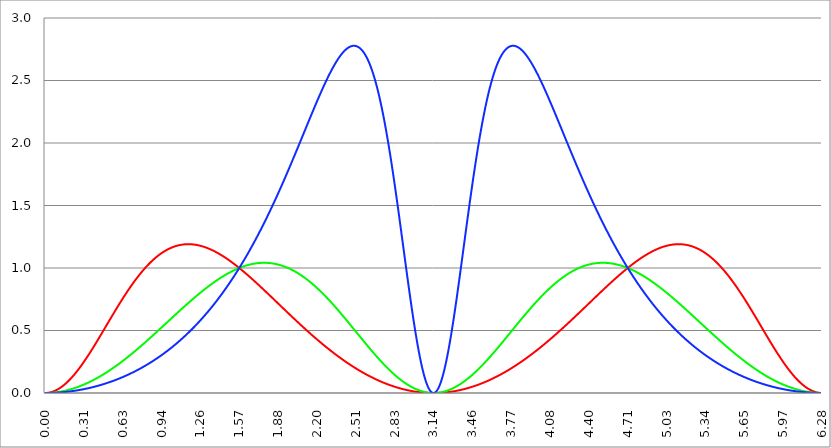
| Category | Series 1 | Series 0 | Series 2 |
|---|---|---|---|
| 0.0 | 0 | 0 | 0 |
| 0.00314159265358979 | 0 | 0 | 0 |
| 0.00628318530717958 | 0 | 0 | 0 |
| 0.00942477796076938 | 0 | 0 | 0 |
| 0.0125663706143592 | 0 | 0 | 0 |
| 0.015707963267949 | 0.001 | 0 | 0 |
| 0.0188495559215388 | 0.001 | 0 | 0 |
| 0.0219911485751285 | 0.001 | 0 | 0 |
| 0.0251327412287183 | 0.002 | 0 | 0 |
| 0.0282743338823081 | 0.002 | 0.001 | 0 |
| 0.0314159265358979 | 0.003 | 0.001 | 0 |
| 0.0345575191894877 | 0.003 | 0.001 | 0 |
| 0.0376991118430775 | 0.004 | 0.001 | 0 |
| 0.0408407044966673 | 0.005 | 0.001 | 0.001 |
| 0.0439822971502571 | 0.005 | 0.001 | 0.001 |
| 0.0471238898038469 | 0.006 | 0.002 | 0.001 |
| 0.0502654824574367 | 0.007 | 0.002 | 0.001 |
| 0.0534070751110265 | 0.008 | 0.002 | 0.001 |
| 0.0565486677646163 | 0.009 | 0.002 | 0.001 |
| 0.059690260418206 | 0.01 | 0.002 | 0.001 |
| 0.0628318530717958 | 0.011 | 0.003 | 0.001 |
| 0.0659734457253856 | 0.012 | 0.003 | 0.001 |
| 0.0691150383789754 | 0.013 | 0.003 | 0.001 |
| 0.0722566310325652 | 0.014 | 0.004 | 0.002 |
| 0.075398223686155 | 0.016 | 0.004 | 0.002 |
| 0.0785398163397448 | 0.017 | 0.004 | 0.002 |
| 0.0816814089933346 | 0.018 | 0.005 | 0.002 |
| 0.0848230016469244 | 0.02 | 0.005 | 0.002 |
| 0.0879645943005142 | 0.021 | 0.005 | 0.002 |
| 0.091106186954104 | 0.023 | 0.006 | 0.003 |
| 0.0942477796076937 | 0.024 | 0.006 | 0.003 |
| 0.0973893722612835 | 0.026 | 0.007 | 0.003 |
| 0.100530964914873 | 0.028 | 0.007 | 0.003 |
| 0.103672557568463 | 0.03 | 0.007 | 0.003 |
| 0.106814150222053 | 0.031 | 0.008 | 0.004 |
| 0.109955742875643 | 0.033 | 0.008 | 0.004 |
| 0.113097335529233 | 0.035 | 0.009 | 0.004 |
| 0.116238928182822 | 0.037 | 0.009 | 0.004 |
| 0.119380520836412 | 0.039 | 0.01 | 0.004 |
| 0.122522113490002 | 0.041 | 0.01 | 0.005 |
| 0.125663706143592 | 0.043 | 0.011 | 0.005 |
| 0.128805298797181 | 0.045 | 0.011 | 0.005 |
| 0.131946891450771 | 0.048 | 0.012 | 0.005 |
| 0.135088484104361 | 0.05 | 0.013 | 0.006 |
| 0.138230076757951 | 0.052 | 0.013 | 0.006 |
| 0.141371669411541 | 0.054 | 0.014 | 0.006 |
| 0.14451326206513 | 0.057 | 0.014 | 0.006 |
| 0.14765485471872 | 0.059 | 0.015 | 0.007 |
| 0.15079644737231 | 0.062 | 0.016 | 0.007 |
| 0.1539380400259 | 0.064 | 0.016 | 0.007 |
| 0.15707963267949 | 0.067 | 0.017 | 0.008 |
| 0.160221225333079 | 0.07 | 0.018 | 0.008 |
| 0.163362817986669 | 0.072 | 0.018 | 0.008 |
| 0.166504410640259 | 0.075 | 0.019 | 0.009 |
| 0.169646003293849 | 0.078 | 0.02 | 0.009 |
| 0.172787595947439 | 0.081 | 0.021 | 0.009 |
| 0.175929188601028 | 0.083 | 0.021 | 0.01 |
| 0.179070781254618 | 0.086 | 0.022 | 0.01 |
| 0.182212373908208 | 0.089 | 0.023 | 0.01 |
| 0.185353966561798 | 0.092 | 0.024 | 0.011 |
| 0.188495559215388 | 0.095 | 0.025 | 0.011 |
| 0.191637151868977 | 0.098 | 0.025 | 0.011 |
| 0.194778744522567 | 0.101 | 0.026 | 0.012 |
| 0.197920337176157 | 0.105 | 0.027 | 0.012 |
| 0.201061929829747 | 0.108 | 0.028 | 0.013 |
| 0.204203522483336 | 0.111 | 0.029 | 0.013 |
| 0.207345115136926 | 0.114 | 0.03 | 0.013 |
| 0.210486707790516 | 0.118 | 0.031 | 0.014 |
| 0.213628300444106 | 0.121 | 0.031 | 0.014 |
| 0.216769893097696 | 0.125 | 0.032 | 0.015 |
| 0.219911485751285 | 0.128 | 0.033 | 0.015 |
| 0.223053078404875 | 0.132 | 0.034 | 0.015 |
| 0.226194671058465 | 0.135 | 0.035 | 0.016 |
| 0.229336263712055 | 0.139 | 0.036 | 0.016 |
| 0.232477856365645 | 0.142 | 0.037 | 0.017 |
| 0.235619449019234 | 0.146 | 0.038 | 0.017 |
| 0.238761041672824 | 0.15 | 0.039 | 0.018 |
| 0.241902634326414 | 0.153 | 0.04 | 0.018 |
| 0.245044226980004 | 0.157 | 0.041 | 0.019 |
| 0.248185819633594 | 0.161 | 0.042 | 0.019 |
| 0.251327412287183 | 0.165 | 0.043 | 0.02 |
| 0.254469004940773 | 0.169 | 0.044 | 0.02 |
| 0.257610597594363 | 0.173 | 0.046 | 0.021 |
| 0.260752190247953 | 0.177 | 0.047 | 0.021 |
| 0.263893782901543 | 0.181 | 0.048 | 0.022 |
| 0.267035375555132 | 0.185 | 0.049 | 0.022 |
| 0.270176968208722 | 0.189 | 0.05 | 0.023 |
| 0.273318560862312 | 0.193 | 0.051 | 0.023 |
| 0.276460153515902 | 0.197 | 0.052 | 0.024 |
| 0.279601746169492 | 0.201 | 0.054 | 0.024 |
| 0.282743338823082 | 0.205 | 0.055 | 0.025 |
| 0.285884931476671 | 0.209 | 0.056 | 0.025 |
| 0.289026524130261 | 0.214 | 0.057 | 0.026 |
| 0.292168116783851 | 0.218 | 0.058 | 0.027 |
| 0.295309709437441 | 0.222 | 0.06 | 0.027 |
| 0.298451302091031 | 0.227 | 0.061 | 0.028 |
| 0.30159289474462 | 0.231 | 0.062 | 0.028 |
| 0.30473448739821 | 0.235 | 0.063 | 0.029 |
| 0.3078760800518 | 0.24 | 0.065 | 0.03 |
| 0.31101767270539 | 0.244 | 0.066 | 0.03 |
| 0.31415926535898 | 0.249 | 0.067 | 0.031 |
| 0.31730085801257 | 0.253 | 0.069 | 0.031 |
| 0.320442450666159 | 0.258 | 0.07 | 0.032 |
| 0.323584043319749 | 0.262 | 0.071 | 0.033 |
| 0.326725635973339 | 0.267 | 0.073 | 0.033 |
| 0.329867228626929 | 0.272 | 0.074 | 0.034 |
| 0.333008821280519 | 0.276 | 0.076 | 0.035 |
| 0.336150413934108 | 0.281 | 0.077 | 0.035 |
| 0.339292006587698 | 0.286 | 0.078 | 0.036 |
| 0.342433599241288 | 0.29 | 0.08 | 0.037 |
| 0.345575191894878 | 0.295 | 0.081 | 0.037 |
| 0.348716784548468 | 0.3 | 0.083 | 0.038 |
| 0.351858377202058 | 0.305 | 0.084 | 0.039 |
| 0.354999969855647 | 0.309 | 0.086 | 0.039 |
| 0.358141562509237 | 0.314 | 0.087 | 0.04 |
| 0.361283155162827 | 0.319 | 0.089 | 0.041 |
| 0.364424747816417 | 0.324 | 0.09 | 0.042 |
| 0.367566340470007 | 0.329 | 0.092 | 0.042 |
| 0.370707933123597 | 0.334 | 0.093 | 0.043 |
| 0.373849525777186 | 0.339 | 0.095 | 0.044 |
| 0.376991118430776 | 0.344 | 0.096 | 0.045 |
| 0.380132711084366 | 0.348 | 0.098 | 0.045 |
| 0.383274303737956 | 0.353 | 0.1 | 0.046 |
| 0.386415896391546 | 0.358 | 0.101 | 0.047 |
| 0.389557489045135 | 0.363 | 0.103 | 0.048 |
| 0.392699081698725 | 0.368 | 0.104 | 0.048 |
| 0.395840674352315 | 0.373 | 0.106 | 0.049 |
| 0.398982267005905 | 0.379 | 0.108 | 0.05 |
| 0.402123859659495 | 0.384 | 0.109 | 0.051 |
| 0.405265452313085 | 0.389 | 0.111 | 0.052 |
| 0.408407044966674 | 0.394 | 0.113 | 0.052 |
| 0.411548637620264 | 0.399 | 0.114 | 0.053 |
| 0.414690230273854 | 0.404 | 0.116 | 0.054 |
| 0.417831822927444 | 0.409 | 0.118 | 0.055 |
| 0.420973415581034 | 0.414 | 0.119 | 0.056 |
| 0.424115008234623 | 0.419 | 0.121 | 0.057 |
| 0.427256600888213 | 0.425 | 0.123 | 0.057 |
| 0.430398193541803 | 0.43 | 0.125 | 0.058 |
| 0.433539786195393 | 0.435 | 0.126 | 0.059 |
| 0.436681378848983 | 0.44 | 0.128 | 0.06 |
| 0.439822971502573 | 0.445 | 0.13 | 0.061 |
| 0.442964564156162 | 0.45 | 0.132 | 0.062 |
| 0.446106156809752 | 0.456 | 0.134 | 0.063 |
| 0.449247749463342 | 0.461 | 0.135 | 0.064 |
| 0.452389342116932 | 0.466 | 0.137 | 0.065 |
| 0.455530934770522 | 0.471 | 0.139 | 0.066 |
| 0.458672527424111 | 0.477 | 0.141 | 0.066 |
| 0.461814120077701 | 0.482 | 0.143 | 0.067 |
| 0.464955712731291 | 0.487 | 0.145 | 0.068 |
| 0.468097305384881 | 0.492 | 0.147 | 0.069 |
| 0.471238898038471 | 0.498 | 0.148 | 0.07 |
| 0.474380490692061 | 0.503 | 0.15 | 0.071 |
| 0.47752208334565 | 0.508 | 0.152 | 0.072 |
| 0.48066367599924 | 0.513 | 0.154 | 0.073 |
| 0.48380526865283 | 0.519 | 0.156 | 0.074 |
| 0.48694686130642 | 0.524 | 0.158 | 0.075 |
| 0.49008845396001 | 0.529 | 0.16 | 0.076 |
| 0.493230046613599 | 0.534 | 0.162 | 0.077 |
| 0.496371639267189 | 0.54 | 0.164 | 0.078 |
| 0.499513231920779 | 0.545 | 0.166 | 0.079 |
| 0.502654824574369 | 0.55 | 0.168 | 0.08 |
| 0.505796417227959 | 0.555 | 0.17 | 0.081 |
| 0.508938009881549 | 0.561 | 0.172 | 0.082 |
| 0.512079602535138 | 0.566 | 0.174 | 0.083 |
| 0.515221195188728 | 0.571 | 0.176 | 0.084 |
| 0.518362787842318 | 0.576 | 0.178 | 0.085 |
| 0.521504380495908 | 0.582 | 0.18 | 0.087 |
| 0.524645973149498 | 0.587 | 0.182 | 0.088 |
| 0.527787565803087 | 0.592 | 0.184 | 0.089 |
| 0.530929158456677 | 0.597 | 0.186 | 0.09 |
| 0.534070751110267 | 0.603 | 0.189 | 0.091 |
| 0.537212343763857 | 0.608 | 0.191 | 0.092 |
| 0.540353936417447 | 0.613 | 0.193 | 0.093 |
| 0.543495529071037 | 0.618 | 0.195 | 0.094 |
| 0.546637121724626 | 0.624 | 0.197 | 0.095 |
| 0.549778714378216 | 0.629 | 0.199 | 0.096 |
| 0.552920307031806 | 0.634 | 0.201 | 0.098 |
| 0.556061899685396 | 0.639 | 0.204 | 0.099 |
| 0.559203492338986 | 0.644 | 0.206 | 0.1 |
| 0.562345084992576 | 0.649 | 0.208 | 0.101 |
| 0.565486677646165 | 0.655 | 0.21 | 0.102 |
| 0.568628270299755 | 0.66 | 0.212 | 0.103 |
| 0.571769862953345 | 0.665 | 0.215 | 0.105 |
| 0.574911455606935 | 0.67 | 0.217 | 0.106 |
| 0.578053048260525 | 0.675 | 0.219 | 0.107 |
| 0.581194640914114 | 0.68 | 0.221 | 0.108 |
| 0.584336233567704 | 0.685 | 0.224 | 0.109 |
| 0.587477826221294 | 0.69 | 0.226 | 0.111 |
| 0.590619418874884 | 0.695 | 0.228 | 0.112 |
| 0.593761011528474 | 0.701 | 0.23 | 0.113 |
| 0.596902604182064 | 0.706 | 0.233 | 0.114 |
| 0.600044196835653 | 0.711 | 0.235 | 0.116 |
| 0.603185789489243 | 0.716 | 0.237 | 0.117 |
| 0.606327382142833 | 0.721 | 0.24 | 0.118 |
| 0.609468974796423 | 0.726 | 0.242 | 0.119 |
| 0.612610567450013 | 0.731 | 0.244 | 0.121 |
| 0.615752160103602 | 0.736 | 0.247 | 0.122 |
| 0.618893752757192 | 0.74 | 0.249 | 0.123 |
| 0.622035345410782 | 0.745 | 0.251 | 0.125 |
| 0.625176938064372 | 0.75 | 0.254 | 0.126 |
| 0.628318530717962 | 0.755 | 0.256 | 0.127 |
| 0.631460123371551 | 0.76 | 0.258 | 0.129 |
| 0.634601716025141 | 0.765 | 0.261 | 0.13 |
| 0.637743308678731 | 0.77 | 0.263 | 0.131 |
| 0.640884901332321 | 0.775 | 0.266 | 0.133 |
| 0.644026493985911 | 0.779 | 0.268 | 0.134 |
| 0.647168086639501 | 0.784 | 0.27 | 0.135 |
| 0.65030967929309 | 0.789 | 0.273 | 0.137 |
| 0.65345127194668 | 0.794 | 0.275 | 0.138 |
| 0.65659286460027 | 0.798 | 0.278 | 0.14 |
| 0.65973445725386 | 0.803 | 0.28 | 0.141 |
| 0.66287604990745 | 0.808 | 0.283 | 0.142 |
| 0.666017642561039 | 0.812 | 0.285 | 0.144 |
| 0.669159235214629 | 0.817 | 0.288 | 0.145 |
| 0.672300827868219 | 0.822 | 0.29 | 0.147 |
| 0.675442420521809 | 0.826 | 0.292 | 0.148 |
| 0.678584013175399 | 0.831 | 0.295 | 0.15 |
| 0.681725605828989 | 0.835 | 0.297 | 0.151 |
| 0.684867198482578 | 0.84 | 0.3 | 0.153 |
| 0.688008791136168 | 0.844 | 0.303 | 0.154 |
| 0.691150383789758 | 0.849 | 0.305 | 0.156 |
| 0.694291976443348 | 0.853 | 0.308 | 0.157 |
| 0.697433569096938 | 0.858 | 0.31 | 0.159 |
| 0.700575161750528 | 0.862 | 0.313 | 0.16 |
| 0.703716754404117 | 0.867 | 0.315 | 0.162 |
| 0.706858347057707 | 0.871 | 0.318 | 0.163 |
| 0.709999939711297 | 0.875 | 0.32 | 0.165 |
| 0.713141532364887 | 0.88 | 0.323 | 0.166 |
| 0.716283125018477 | 0.884 | 0.325 | 0.168 |
| 0.719424717672066 | 0.888 | 0.328 | 0.169 |
| 0.722566310325656 | 0.893 | 0.331 | 0.171 |
| 0.725707902979246 | 0.897 | 0.333 | 0.172 |
| 0.728849495632836 | 0.901 | 0.336 | 0.174 |
| 0.731991088286426 | 0.905 | 0.338 | 0.176 |
| 0.735132680940016 | 0.909 | 0.341 | 0.177 |
| 0.738274273593605 | 0.914 | 0.344 | 0.179 |
| 0.741415866247195 | 0.918 | 0.346 | 0.18 |
| 0.744557458900785 | 0.922 | 0.349 | 0.182 |
| 0.747699051554375 | 0.926 | 0.352 | 0.184 |
| 0.750840644207965 | 0.93 | 0.354 | 0.185 |
| 0.753982236861554 | 0.934 | 0.357 | 0.187 |
| 0.757123829515144 | 0.938 | 0.36 | 0.189 |
| 0.760265422168734 | 0.942 | 0.362 | 0.19 |
| 0.763407014822324 | 0.946 | 0.365 | 0.192 |
| 0.766548607475914 | 0.949 | 0.368 | 0.194 |
| 0.769690200129504 | 0.953 | 0.37 | 0.195 |
| 0.772831792783093 | 0.957 | 0.373 | 0.197 |
| 0.775973385436683 | 0.961 | 0.376 | 0.199 |
| 0.779114978090273 | 0.965 | 0.378 | 0.2 |
| 0.782256570743863 | 0.968 | 0.381 | 0.202 |
| 0.785398163397453 | 0.972 | 0.384 | 0.204 |
| 0.788539756051042 | 0.976 | 0.386 | 0.206 |
| 0.791681348704632 | 0.98 | 0.389 | 0.207 |
| 0.794822941358222 | 0.983 | 0.392 | 0.209 |
| 0.797964534011812 | 0.987 | 0.395 | 0.211 |
| 0.801106126665402 | 0.99 | 0.397 | 0.213 |
| 0.804247719318992 | 0.994 | 0.4 | 0.215 |
| 0.807389311972581 | 0.997 | 0.403 | 0.216 |
| 0.810530904626171 | 1.001 | 0.406 | 0.218 |
| 0.813672497279761 | 1.004 | 0.408 | 0.22 |
| 0.816814089933351 | 1.008 | 0.411 | 0.222 |
| 0.819955682586941 | 1.011 | 0.414 | 0.224 |
| 0.823097275240531 | 1.014 | 0.417 | 0.226 |
| 0.82623886789412 | 1.018 | 0.419 | 0.227 |
| 0.82938046054771 | 1.021 | 0.422 | 0.229 |
| 0.8325220532013 | 1.024 | 0.425 | 0.231 |
| 0.83566364585489 | 1.028 | 0.428 | 0.233 |
| 0.83880523850848 | 1.031 | 0.431 | 0.235 |
| 0.841946831162069 | 1.034 | 0.433 | 0.237 |
| 0.845088423815659 | 1.037 | 0.436 | 0.239 |
| 0.848230016469249 | 1.04 | 0.439 | 0.241 |
| 0.851371609122839 | 1.043 | 0.442 | 0.243 |
| 0.854513201776429 | 1.046 | 0.444 | 0.245 |
| 0.857654794430019 | 1.049 | 0.447 | 0.246 |
| 0.860796387083608 | 1.052 | 0.45 | 0.248 |
| 0.863937979737198 | 1.055 | 0.453 | 0.25 |
| 0.867079572390788 | 1.058 | 0.456 | 0.252 |
| 0.870221165044378 | 1.061 | 0.459 | 0.254 |
| 0.873362757697968 | 1.064 | 0.461 | 0.256 |
| 0.876504350351557 | 1.067 | 0.464 | 0.258 |
| 0.879645943005147 | 1.07 | 0.467 | 0.26 |
| 0.882787535658737 | 1.072 | 0.47 | 0.262 |
| 0.885929128312327 | 1.075 | 0.473 | 0.264 |
| 0.889070720965917 | 1.078 | 0.476 | 0.267 |
| 0.892212313619507 | 1.08 | 0.478 | 0.269 |
| 0.895353906273096 | 1.083 | 0.481 | 0.271 |
| 0.898495498926686 | 1.086 | 0.484 | 0.273 |
| 0.901637091580276 | 1.088 | 0.487 | 0.275 |
| 0.904778684233866 | 1.091 | 0.49 | 0.277 |
| 0.907920276887456 | 1.093 | 0.493 | 0.279 |
| 0.911061869541045 | 1.096 | 0.495 | 0.281 |
| 0.914203462194635 | 1.098 | 0.498 | 0.283 |
| 0.917345054848225 | 1.101 | 0.501 | 0.285 |
| 0.920486647501815 | 1.103 | 0.504 | 0.288 |
| 0.923628240155405 | 1.105 | 0.507 | 0.29 |
| 0.926769832808995 | 1.108 | 0.51 | 0.292 |
| 0.929911425462584 | 1.11 | 0.513 | 0.294 |
| 0.933053018116174 | 1.112 | 0.515 | 0.296 |
| 0.936194610769764 | 1.114 | 0.518 | 0.298 |
| 0.939336203423354 | 1.117 | 0.521 | 0.301 |
| 0.942477796076944 | 1.119 | 0.524 | 0.303 |
| 0.945619388730533 | 1.121 | 0.527 | 0.305 |
| 0.948760981384123 | 1.123 | 0.53 | 0.307 |
| 0.951902574037713 | 1.125 | 0.533 | 0.309 |
| 0.955044166691303 | 1.127 | 0.536 | 0.312 |
| 0.958185759344893 | 1.129 | 0.538 | 0.314 |
| 0.961327351998483 | 1.131 | 0.541 | 0.316 |
| 0.964468944652072 | 1.133 | 0.544 | 0.319 |
| 0.967610537305662 | 1.135 | 0.547 | 0.321 |
| 0.970752129959252 | 1.137 | 0.55 | 0.323 |
| 0.973893722612842 | 1.138 | 0.553 | 0.326 |
| 0.977035315266432 | 1.14 | 0.556 | 0.328 |
| 0.980176907920022 | 1.142 | 0.559 | 0.33 |
| 0.983318500573611 | 1.144 | 0.561 | 0.333 |
| 0.986460093227201 | 1.145 | 0.564 | 0.335 |
| 0.989601685880791 | 1.147 | 0.567 | 0.337 |
| 0.992743278534381 | 1.149 | 0.57 | 0.34 |
| 0.995884871187971 | 1.15 | 0.573 | 0.342 |
| 0.99902646384156 | 1.152 | 0.576 | 0.344 |
| 1.00216805649515 | 1.153 | 0.579 | 0.347 |
| 1.00530964914874 | 1.155 | 0.582 | 0.349 |
| 1.00845124180233 | 1.156 | 0.584 | 0.352 |
| 1.01159283445592 | 1.158 | 0.587 | 0.354 |
| 1.01473442710951 | 1.159 | 0.59 | 0.357 |
| 1.017876019763099 | 1.161 | 0.593 | 0.359 |
| 1.021017612416689 | 1.162 | 0.596 | 0.362 |
| 1.02415920507028 | 1.163 | 0.599 | 0.364 |
| 1.027300797723869 | 1.165 | 0.602 | 0.367 |
| 1.030442390377459 | 1.166 | 0.605 | 0.369 |
| 1.033583983031048 | 1.167 | 0.607 | 0.372 |
| 1.036725575684638 | 1.168 | 0.61 | 0.374 |
| 1.039867168338228 | 1.169 | 0.613 | 0.377 |
| 1.043008760991818 | 1.17 | 0.616 | 0.379 |
| 1.046150353645408 | 1.172 | 0.619 | 0.382 |
| 1.049291946298998 | 1.173 | 0.622 | 0.384 |
| 1.052433538952587 | 1.174 | 0.625 | 0.387 |
| 1.055575131606177 | 1.175 | 0.627 | 0.39 |
| 1.058716724259767 | 1.176 | 0.63 | 0.392 |
| 1.061858316913357 | 1.176 | 0.633 | 0.395 |
| 1.064999909566947 | 1.177 | 0.636 | 0.397 |
| 1.068141502220536 | 1.178 | 0.639 | 0.4 |
| 1.071283094874126 | 1.179 | 0.642 | 0.403 |
| 1.074424687527716 | 1.18 | 0.645 | 0.405 |
| 1.077566280181306 | 1.181 | 0.647 | 0.408 |
| 1.080707872834896 | 1.181 | 0.65 | 0.411 |
| 1.083849465488486 | 1.182 | 0.653 | 0.414 |
| 1.086991058142075 | 1.183 | 0.656 | 0.416 |
| 1.090132650795665 | 1.184 | 0.659 | 0.419 |
| 1.093274243449255 | 1.184 | 0.662 | 0.422 |
| 1.096415836102845 | 1.185 | 0.664 | 0.424 |
| 1.099557428756435 | 1.185 | 0.667 | 0.427 |
| 1.102699021410025 | 1.186 | 0.67 | 0.43 |
| 1.105840614063614 | 1.186 | 0.673 | 0.433 |
| 1.108982206717204 | 1.187 | 0.676 | 0.436 |
| 1.112123799370794 | 1.187 | 0.678 | 0.438 |
| 1.115265392024384 | 1.188 | 0.681 | 0.441 |
| 1.118406984677974 | 1.188 | 0.684 | 0.444 |
| 1.121548577331563 | 1.188 | 0.687 | 0.447 |
| 1.124690169985153 | 1.189 | 0.69 | 0.45 |
| 1.127831762638743 | 1.189 | 0.692 | 0.453 |
| 1.130973355292333 | 1.189 | 0.695 | 0.456 |
| 1.134114947945923 | 1.19 | 0.698 | 0.458 |
| 1.137256540599513 | 1.19 | 0.701 | 0.461 |
| 1.140398133253102 | 1.19 | 0.704 | 0.464 |
| 1.143539725906692 | 1.19 | 0.706 | 0.467 |
| 1.146681318560282 | 1.19 | 0.709 | 0.47 |
| 1.149822911213872 | 1.19 | 0.712 | 0.473 |
| 1.152964503867462 | 1.19 | 0.715 | 0.476 |
| 1.156106096521051 | 1.19 | 0.717 | 0.479 |
| 1.159247689174641 | 1.19 | 0.72 | 0.482 |
| 1.162389281828231 | 1.19 | 0.723 | 0.485 |
| 1.165530874481821 | 1.19 | 0.726 | 0.488 |
| 1.168672467135411 | 1.19 | 0.728 | 0.491 |
| 1.171814059789001 | 1.19 | 0.731 | 0.494 |
| 1.17495565244259 | 1.19 | 0.734 | 0.497 |
| 1.17809724509618 | 1.19 | 0.737 | 0.5 |
| 1.18123883774977 | 1.19 | 0.739 | 0.503 |
| 1.18438043040336 | 1.19 | 0.742 | 0.507 |
| 1.18752202305695 | 1.189 | 0.745 | 0.51 |
| 1.190663615710539 | 1.189 | 0.747 | 0.513 |
| 1.193805208364129 | 1.189 | 0.75 | 0.516 |
| 1.19694680101772 | 1.188 | 0.753 | 0.519 |
| 1.200088393671309 | 1.188 | 0.755 | 0.522 |
| 1.203229986324899 | 1.188 | 0.758 | 0.525 |
| 1.206371578978489 | 1.187 | 0.761 | 0.529 |
| 1.209513171632078 | 1.187 | 0.763 | 0.532 |
| 1.212654764285668 | 1.187 | 0.766 | 0.535 |
| 1.215796356939258 | 1.186 | 0.769 | 0.538 |
| 1.218937949592848 | 1.186 | 0.771 | 0.541 |
| 1.222079542246438 | 1.185 | 0.774 | 0.545 |
| 1.225221134900027 | 1.184 | 0.776 | 0.548 |
| 1.228362727553617 | 1.184 | 0.779 | 0.551 |
| 1.231504320207207 | 1.183 | 0.782 | 0.555 |
| 1.234645912860797 | 1.183 | 0.784 | 0.558 |
| 1.237787505514387 | 1.182 | 0.787 | 0.561 |
| 1.240929098167977 | 1.181 | 0.789 | 0.565 |
| 1.244070690821566 | 1.181 | 0.792 | 0.568 |
| 1.247212283475156 | 1.18 | 0.795 | 0.571 |
| 1.250353876128746 | 1.179 | 0.797 | 0.575 |
| 1.253495468782336 | 1.178 | 0.8 | 0.578 |
| 1.256637061435926 | 1.178 | 0.802 | 0.581 |
| 1.259778654089515 | 1.177 | 0.805 | 0.585 |
| 1.262920246743105 | 1.176 | 0.807 | 0.588 |
| 1.266061839396695 | 1.175 | 0.81 | 0.592 |
| 1.269203432050285 | 1.174 | 0.812 | 0.595 |
| 1.272345024703875 | 1.173 | 0.815 | 0.599 |
| 1.275486617357465 | 1.172 | 0.817 | 0.602 |
| 1.278628210011054 | 1.171 | 0.82 | 0.606 |
| 1.281769802664644 | 1.17 | 0.822 | 0.609 |
| 1.284911395318234 | 1.169 | 0.825 | 0.613 |
| 1.288052987971824 | 1.168 | 0.827 | 0.616 |
| 1.291194580625414 | 1.167 | 0.83 | 0.62 |
| 1.294336173279003 | 1.166 | 0.832 | 0.623 |
| 1.297477765932593 | 1.165 | 0.835 | 0.627 |
| 1.300619358586183 | 1.164 | 0.837 | 0.631 |
| 1.303760951239773 | 1.163 | 0.839 | 0.634 |
| 1.306902543893363 | 1.162 | 0.842 | 0.638 |
| 1.310044136546953 | 1.161 | 0.844 | 0.642 |
| 1.313185729200542 | 1.159 | 0.847 | 0.645 |
| 1.316327321854132 | 1.158 | 0.849 | 0.649 |
| 1.319468914507722 | 1.157 | 0.851 | 0.653 |
| 1.322610507161312 | 1.156 | 0.854 | 0.656 |
| 1.325752099814902 | 1.154 | 0.856 | 0.66 |
| 1.328893692468491 | 1.153 | 0.858 | 0.664 |
| 1.332035285122081 | 1.152 | 0.861 | 0.668 |
| 1.335176877775671 | 1.15 | 0.863 | 0.671 |
| 1.338318470429261 | 1.149 | 0.865 | 0.675 |
| 1.341460063082851 | 1.148 | 0.868 | 0.679 |
| 1.344601655736441 | 1.146 | 0.87 | 0.683 |
| 1.34774324839003 | 1.145 | 0.872 | 0.687 |
| 1.35088484104362 | 1.143 | 0.874 | 0.69 |
| 1.35402643369721 | 1.142 | 0.877 | 0.694 |
| 1.3571680263508 | 1.14 | 0.879 | 0.698 |
| 1.36030961900439 | 1.139 | 0.881 | 0.702 |
| 1.363451211657979 | 1.137 | 0.883 | 0.706 |
| 1.36659280431157 | 1.136 | 0.886 | 0.71 |
| 1.369734396965159 | 1.134 | 0.888 | 0.714 |
| 1.372875989618749 | 1.132 | 0.89 | 0.718 |
| 1.376017582272339 | 1.131 | 0.892 | 0.722 |
| 1.379159174925929 | 1.129 | 0.894 | 0.726 |
| 1.382300767579518 | 1.128 | 0.896 | 0.73 |
| 1.385442360233108 | 1.126 | 0.899 | 0.734 |
| 1.388583952886698 | 1.124 | 0.901 | 0.738 |
| 1.391725545540288 | 1.123 | 0.903 | 0.742 |
| 1.394867138193878 | 1.121 | 0.905 | 0.746 |
| 1.398008730847468 | 1.119 | 0.907 | 0.75 |
| 1.401150323501057 | 1.117 | 0.909 | 0.754 |
| 1.404291916154647 | 1.116 | 0.911 | 0.758 |
| 1.407433508808237 | 1.114 | 0.913 | 0.762 |
| 1.410575101461827 | 1.112 | 0.915 | 0.766 |
| 1.413716694115417 | 1.11 | 0.917 | 0.771 |
| 1.416858286769006 | 1.108 | 0.919 | 0.775 |
| 1.419999879422596 | 1.106 | 0.921 | 0.779 |
| 1.423141472076186 | 1.105 | 0.923 | 0.783 |
| 1.426283064729776 | 1.103 | 0.925 | 0.787 |
| 1.429424657383366 | 1.101 | 0.927 | 0.792 |
| 1.432566250036956 | 1.099 | 0.929 | 0.796 |
| 1.435707842690545 | 1.097 | 0.931 | 0.8 |
| 1.438849435344135 | 1.095 | 0.933 | 0.804 |
| 1.441991027997725 | 1.093 | 0.935 | 0.809 |
| 1.445132620651315 | 1.091 | 0.937 | 0.813 |
| 1.448274213304905 | 1.089 | 0.939 | 0.817 |
| 1.451415805958494 | 1.087 | 0.94 | 0.822 |
| 1.454557398612084 | 1.085 | 0.942 | 0.826 |
| 1.457698991265674 | 1.083 | 0.944 | 0.831 |
| 1.460840583919264 | 1.081 | 0.946 | 0.835 |
| 1.463982176572854 | 1.079 | 0.948 | 0.839 |
| 1.467123769226444 | 1.077 | 0.95 | 0.844 |
| 1.470265361880033 | 1.074 | 0.951 | 0.848 |
| 1.473406954533623 | 1.072 | 0.953 | 0.853 |
| 1.476548547187213 | 1.07 | 0.955 | 0.857 |
| 1.479690139840803 | 1.068 | 0.957 | 0.862 |
| 1.482831732494393 | 1.066 | 0.958 | 0.866 |
| 1.485973325147982 | 1.064 | 0.96 | 0.871 |
| 1.489114917801572 | 1.061 | 0.962 | 0.875 |
| 1.492256510455162 | 1.059 | 0.963 | 0.88 |
| 1.495398103108752 | 1.057 | 0.965 | 0.885 |
| 1.498539695762342 | 1.055 | 0.967 | 0.889 |
| 1.501681288415932 | 1.053 | 0.968 | 0.894 |
| 1.504822881069521 | 1.05 | 0.97 | 0.898 |
| 1.507964473723111 | 1.048 | 0.972 | 0.903 |
| 1.511106066376701 | 1.046 | 0.973 | 0.908 |
| 1.514247659030291 | 1.043 | 0.975 | 0.912 |
| 1.517389251683881 | 1.041 | 0.976 | 0.917 |
| 1.520530844337471 | 1.039 | 0.978 | 0.922 |
| 1.52367243699106 | 1.036 | 0.979 | 0.927 |
| 1.52681402964465 | 1.034 | 0.981 | 0.931 |
| 1.52995562229824 | 1.032 | 0.982 | 0.936 |
| 1.53309721495183 | 1.029 | 0.984 | 0.941 |
| 1.53623880760542 | 1.027 | 0.985 | 0.946 |
| 1.539380400259009 | 1.025 | 0.987 | 0.951 |
| 1.542521992912599 | 1.022 | 0.988 | 0.955 |
| 1.545663585566189 | 1.02 | 0.989 | 0.96 |
| 1.548805178219779 | 1.017 | 0.991 | 0.965 |
| 1.551946770873369 | 1.015 | 0.992 | 0.97 |
| 1.555088363526959 | 1.012 | 0.994 | 0.975 |
| 1.558229956180548 | 1.01 | 0.995 | 0.98 |
| 1.561371548834138 | 1.007 | 0.996 | 0.985 |
| 1.564513141487728 | 1.005 | 0.997 | 0.99 |
| 1.567654734141318 | 1.003 | 0.999 | 0.995 |
| 1.570796326794908 | 1 | 1 | 1 |
| 1.573937919448497 | 0.997 | 1.001 | 1.005 |
| 1.577079512102087 | 0.995 | 1.002 | 1.01 |
| 1.580221104755677 | 0.992 | 1.004 | 1.015 |
| 1.583362697409267 | 0.99 | 1.005 | 1.02 |
| 1.586504290062857 | 0.987 | 1.006 | 1.025 |
| 1.589645882716447 | 0.985 | 1.007 | 1.03 |
| 1.592787475370036 | 0.982 | 1.008 | 1.036 |
| 1.595929068023626 | 0.98 | 1.009 | 1.041 |
| 1.599070660677216 | 0.977 | 1.011 | 1.046 |
| 1.602212253330806 | 0.974 | 1.012 | 1.051 |
| 1.605353845984396 | 0.972 | 1.013 | 1.056 |
| 1.608495438637985 | 0.969 | 1.014 | 1.062 |
| 1.611637031291575 | 0.967 | 1.015 | 1.067 |
| 1.614778623945165 | 0.964 | 1.016 | 1.072 |
| 1.617920216598755 | 0.961 | 1.017 | 1.077 |
| 1.621061809252345 | 0.959 | 1.018 | 1.083 |
| 1.624203401905935 | 0.956 | 1.019 | 1.088 |
| 1.627344994559524 | 0.953 | 1.02 | 1.093 |
| 1.630486587213114 | 0.951 | 1.021 | 1.099 |
| 1.633628179866704 | 0.948 | 1.022 | 1.104 |
| 1.636769772520294 | 0.945 | 1.022 | 1.11 |
| 1.639911365173884 | 0.942 | 1.023 | 1.115 |
| 1.643052957827473 | 0.94 | 1.024 | 1.12 |
| 1.646194550481063 | 0.937 | 1.025 | 1.126 |
| 1.649336143134653 | 0.934 | 1.026 | 1.131 |
| 1.652477735788243 | 0.932 | 1.027 | 1.137 |
| 1.655619328441833 | 0.929 | 1.027 | 1.142 |
| 1.658760921095423 | 0.926 | 1.028 | 1.148 |
| 1.661902513749012 | 0.923 | 1.029 | 1.154 |
| 1.665044106402602 | 0.921 | 1.03 | 1.159 |
| 1.668185699056192 | 0.918 | 1.03 | 1.165 |
| 1.671327291709782 | 0.915 | 1.031 | 1.17 |
| 1.674468884363372 | 0.912 | 1.032 | 1.176 |
| 1.677610477016961 | 0.909 | 1.032 | 1.182 |
| 1.680752069670551 | 0.907 | 1.033 | 1.187 |
| 1.683893662324141 | 0.904 | 1.033 | 1.193 |
| 1.687035254977731 | 0.901 | 1.034 | 1.199 |
| 1.690176847631321 | 0.898 | 1.035 | 1.204 |
| 1.693318440284911 | 0.895 | 1.035 | 1.21 |
| 1.6964600329385 | 0.893 | 1.036 | 1.216 |
| 1.69960162559209 | 0.89 | 1.036 | 1.222 |
| 1.70274321824568 | 0.887 | 1.037 | 1.227 |
| 1.70588481089927 | 0.884 | 1.037 | 1.233 |
| 1.70902640355286 | 0.881 | 1.037 | 1.239 |
| 1.712167996206449 | 0.878 | 1.038 | 1.245 |
| 1.715309588860039 | 0.875 | 1.038 | 1.251 |
| 1.71845118151363 | 0.873 | 1.039 | 1.257 |
| 1.721592774167219 | 0.87 | 1.039 | 1.263 |
| 1.724734366820809 | 0.867 | 1.039 | 1.269 |
| 1.727875959474399 | 0.864 | 1.04 | 1.275 |
| 1.731017552127988 | 0.861 | 1.04 | 1.281 |
| 1.734159144781578 | 0.858 | 1.04 | 1.287 |
| 1.737300737435168 | 0.855 | 1.04 | 1.293 |
| 1.740442330088758 | 0.852 | 1.041 | 1.299 |
| 1.743583922742348 | 0.85 | 1.041 | 1.305 |
| 1.746725515395937 | 0.847 | 1.041 | 1.311 |
| 1.749867108049527 | 0.844 | 1.041 | 1.317 |
| 1.753008700703117 | 0.841 | 1.041 | 1.323 |
| 1.756150293356707 | 0.838 | 1.041 | 1.329 |
| 1.759291886010297 | 0.835 | 1.041 | 1.335 |
| 1.762433478663887 | 0.832 | 1.042 | 1.341 |
| 1.765575071317476 | 0.829 | 1.042 | 1.348 |
| 1.768716663971066 | 0.826 | 1.042 | 1.354 |
| 1.771858256624656 | 0.823 | 1.042 | 1.36 |
| 1.774999849278246 | 0.82 | 1.042 | 1.366 |
| 1.778141441931836 | 0.817 | 1.042 | 1.372 |
| 1.781283034585426 | 0.815 | 1.042 | 1.379 |
| 1.784424627239015 | 0.812 | 1.042 | 1.385 |
| 1.787566219892605 | 0.809 | 1.041 | 1.391 |
| 1.790707812546195 | 0.806 | 1.041 | 1.398 |
| 1.793849405199785 | 0.803 | 1.041 | 1.404 |
| 1.796990997853375 | 0.8 | 1.041 | 1.41 |
| 1.800132590506964 | 0.797 | 1.041 | 1.417 |
| 1.803274183160554 | 0.794 | 1.041 | 1.423 |
| 1.806415775814144 | 0.791 | 1.04 | 1.43 |
| 1.809557368467734 | 0.788 | 1.04 | 1.436 |
| 1.812698961121324 | 0.785 | 1.04 | 1.443 |
| 1.815840553774914 | 0.782 | 1.04 | 1.449 |
| 1.818982146428503 | 0.779 | 1.039 | 1.456 |
| 1.822123739082093 | 0.776 | 1.039 | 1.462 |
| 1.825265331735683 | 0.773 | 1.039 | 1.469 |
| 1.828406924389273 | 0.77 | 1.038 | 1.475 |
| 1.831548517042863 | 0.767 | 1.038 | 1.482 |
| 1.834690109696452 | 0.764 | 1.037 | 1.488 |
| 1.837831702350042 | 0.761 | 1.037 | 1.495 |
| 1.840973295003632 | 0.758 | 1.036 | 1.502 |
| 1.844114887657222 | 0.755 | 1.036 | 1.508 |
| 1.847256480310812 | 0.752 | 1.035 | 1.515 |
| 1.850398072964402 | 0.749 | 1.035 | 1.522 |
| 1.853539665617991 | 0.746 | 1.034 | 1.528 |
| 1.856681258271581 | 0.743 | 1.034 | 1.535 |
| 1.859822850925171 | 0.74 | 1.033 | 1.542 |
| 1.862964443578761 | 0.737 | 1.033 | 1.548 |
| 1.866106036232351 | 0.734 | 1.032 | 1.555 |
| 1.86924762888594 | 0.731 | 1.031 | 1.562 |
| 1.87238922153953 | 0.728 | 1.031 | 1.569 |
| 1.87553081419312 | 0.725 | 1.03 | 1.576 |
| 1.87867240684671 | 0.722 | 1.029 | 1.582 |
| 1.8818139995003 | 0.719 | 1.028 | 1.589 |
| 1.88495559215389 | 0.716 | 1.028 | 1.596 |
| 1.888097184807479 | 0.713 | 1.027 | 1.603 |
| 1.891238777461069 | 0.71 | 1.026 | 1.61 |
| 1.89438037011466 | 0.707 | 1.025 | 1.617 |
| 1.897521962768249 | 0.705 | 1.024 | 1.624 |
| 1.900663555421839 | 0.702 | 1.023 | 1.631 |
| 1.903805148075429 | 0.699 | 1.022 | 1.638 |
| 1.906946740729018 | 0.696 | 1.022 | 1.645 |
| 1.910088333382608 | 0.693 | 1.021 | 1.652 |
| 1.913229926036198 | 0.69 | 1.02 | 1.659 |
| 1.916371518689788 | 0.687 | 1.019 | 1.666 |
| 1.919513111343378 | 0.684 | 1.018 | 1.673 |
| 1.922654703996967 | 0.681 | 1.017 | 1.68 |
| 1.925796296650557 | 0.678 | 1.015 | 1.687 |
| 1.928937889304147 | 0.675 | 1.014 | 1.694 |
| 1.932079481957737 | 0.672 | 1.013 | 1.701 |
| 1.935221074611327 | 0.669 | 1.012 | 1.708 |
| 1.938362667264917 | 0.666 | 1.011 | 1.715 |
| 1.941504259918506 | 0.663 | 1.01 | 1.723 |
| 1.944645852572096 | 0.66 | 1.009 | 1.73 |
| 1.947787445225686 | 0.657 | 1.007 | 1.737 |
| 1.950929037879276 | 0.654 | 1.006 | 1.744 |
| 1.954070630532866 | 0.651 | 1.005 | 1.751 |
| 1.957212223186455 | 0.648 | 1.004 | 1.758 |
| 1.960353815840045 | 0.645 | 1.002 | 1.766 |
| 1.963495408493635 | 0.642 | 1.001 | 1.773 |
| 1.966637001147225 | 0.639 | 1 | 1.78 |
| 1.969778593800815 | 0.636 | 0.998 | 1.787 |
| 1.972920186454405 | 0.633 | 0.997 | 1.795 |
| 1.976061779107994 | 0.63 | 0.995 | 1.802 |
| 1.979203371761584 | 0.627 | 0.994 | 1.809 |
| 1.982344964415174 | 0.624 | 0.992 | 1.817 |
| 1.985486557068764 | 0.621 | 0.991 | 1.824 |
| 1.988628149722354 | 0.618 | 0.989 | 1.831 |
| 1.991769742375943 | 0.615 | 0.988 | 1.839 |
| 1.994911335029533 | 0.612 | 0.986 | 1.846 |
| 1.998052927683123 | 0.609 | 0.985 | 1.853 |
| 2.001194520336712 | 0.607 | 0.983 | 1.861 |
| 2.004336112990302 | 0.604 | 0.982 | 1.868 |
| 2.007477705643892 | 0.601 | 0.98 | 1.876 |
| 2.010619298297482 | 0.598 | 0.978 | 1.883 |
| 2.013760890951071 | 0.595 | 0.977 | 1.89 |
| 2.016902483604661 | 0.592 | 0.975 | 1.898 |
| 2.02004407625825 | 0.589 | 0.973 | 1.905 |
| 2.02318566891184 | 0.586 | 0.971 | 1.913 |
| 2.02632726156543 | 0.583 | 0.97 | 1.92 |
| 2.029468854219019 | 0.58 | 0.968 | 1.928 |
| 2.032610446872609 | 0.577 | 0.966 | 1.935 |
| 2.035752039526198 | 0.574 | 0.964 | 1.943 |
| 2.038893632179788 | 0.572 | 0.962 | 1.95 |
| 2.042035224833378 | 0.569 | 0.96 | 1.958 |
| 2.045176817486967 | 0.566 | 0.958 | 1.965 |
| 2.048318410140557 | 0.563 | 0.957 | 1.973 |
| 2.051460002794146 | 0.56 | 0.955 | 1.98 |
| 2.054601595447736 | 0.557 | 0.953 | 1.988 |
| 2.057743188101325 | 0.554 | 0.951 | 1.995 |
| 2.060884780754915 | 0.551 | 0.949 | 2.003 |
| 2.064026373408505 | 0.548 | 0.947 | 2.01 |
| 2.067167966062094 | 0.546 | 0.945 | 2.018 |
| 2.070309558715684 | 0.543 | 0.942 | 2.025 |
| 2.073451151369273 | 0.54 | 0.94 | 2.033 |
| 2.076592744022863 | 0.537 | 0.938 | 2.041 |
| 2.079734336676452 | 0.534 | 0.936 | 2.048 |
| 2.082875929330042 | 0.531 | 0.934 | 2.056 |
| 2.086017521983632 | 0.528 | 0.932 | 2.063 |
| 2.089159114637221 | 0.526 | 0.93 | 2.071 |
| 2.092300707290811 | 0.523 | 0.927 | 2.078 |
| 2.095442299944401 | 0.52 | 0.925 | 2.086 |
| 2.09858389259799 | 0.517 | 0.923 | 2.093 |
| 2.10172548525158 | 0.514 | 0.921 | 2.101 |
| 2.104867077905169 | 0.511 | 0.918 | 2.109 |
| 2.108008670558759 | 0.509 | 0.916 | 2.116 |
| 2.111150263212349 | 0.506 | 0.914 | 2.124 |
| 2.114291855865938 | 0.503 | 0.911 | 2.131 |
| 2.117433448519528 | 0.5 | 0.909 | 2.139 |
| 2.120575041173117 | 0.497 | 0.907 | 2.146 |
| 2.123716633826707 | 0.495 | 0.904 | 2.154 |
| 2.126858226480297 | 0.492 | 0.902 | 2.161 |
| 2.129999819133886 | 0.489 | 0.899 | 2.169 |
| 2.133141411787476 | 0.486 | 0.897 | 2.176 |
| 2.136283004441065 | 0.483 | 0.894 | 2.184 |
| 2.139424597094655 | 0.481 | 0.892 | 2.191 |
| 2.142566189748245 | 0.478 | 0.889 | 2.199 |
| 2.145707782401834 | 0.475 | 0.887 | 2.206 |
| 2.148849375055424 | 0.472 | 0.884 | 2.214 |
| 2.151990967709013 | 0.47 | 0.882 | 2.221 |
| 2.155132560362603 | 0.467 | 0.879 | 2.229 |
| 2.158274153016193 | 0.464 | 0.876 | 2.236 |
| 2.161415745669782 | 0.461 | 0.874 | 2.244 |
| 2.164557338323372 | 0.459 | 0.871 | 2.251 |
| 2.167698930976961 | 0.456 | 0.868 | 2.259 |
| 2.170840523630551 | 0.453 | 0.866 | 2.266 |
| 2.173982116284141 | 0.451 | 0.863 | 2.273 |
| 2.17712370893773 | 0.448 | 0.86 | 2.281 |
| 2.18026530159132 | 0.445 | 0.857 | 2.288 |
| 2.183406894244909 | 0.442 | 0.855 | 2.296 |
| 2.186548486898499 | 0.44 | 0.852 | 2.303 |
| 2.189690079552089 | 0.437 | 0.849 | 2.31 |
| 2.192831672205678 | 0.434 | 0.846 | 2.317 |
| 2.195973264859268 | 0.432 | 0.843 | 2.325 |
| 2.199114857512857 | 0.429 | 0.841 | 2.332 |
| 2.202256450166447 | 0.426 | 0.838 | 2.339 |
| 2.205398042820036 | 0.424 | 0.835 | 2.347 |
| 2.208539635473626 | 0.421 | 0.832 | 2.354 |
| 2.211681228127216 | 0.418 | 0.829 | 2.361 |
| 2.214822820780805 | 0.416 | 0.826 | 2.368 |
| 2.217964413434395 | 0.413 | 0.823 | 2.375 |
| 2.221106006087984 | 0.411 | 0.82 | 2.382 |
| 2.224247598741574 | 0.408 | 0.817 | 2.389 |
| 2.227389191395164 | 0.405 | 0.814 | 2.396 |
| 2.230530784048753 | 0.403 | 0.811 | 2.403 |
| 2.233672376702343 | 0.4 | 0.808 | 2.41 |
| 2.236813969355933 | 0.397 | 0.805 | 2.417 |
| 2.239955562009522 | 0.395 | 0.802 | 2.424 |
| 2.243097154663112 | 0.392 | 0.799 | 2.431 |
| 2.246238747316701 | 0.39 | 0.796 | 2.438 |
| 2.249380339970291 | 0.387 | 0.792 | 2.445 |
| 2.252521932623881 | 0.385 | 0.789 | 2.452 |
| 2.25566352527747 | 0.382 | 0.786 | 2.459 |
| 2.25880511793106 | 0.38 | 0.783 | 2.465 |
| 2.261946710584649 | 0.377 | 0.78 | 2.472 |
| 2.265088303238239 | 0.374 | 0.777 | 2.479 |
| 2.268229895891829 | 0.372 | 0.773 | 2.485 |
| 2.271371488545418 | 0.369 | 0.77 | 2.492 |
| 2.274513081199008 | 0.367 | 0.767 | 2.499 |
| 2.277654673852597 | 0.364 | 0.764 | 2.505 |
| 2.280796266506186 | 0.362 | 0.76 | 2.511 |
| 2.283937859159776 | 0.359 | 0.757 | 2.518 |
| 2.287079451813366 | 0.357 | 0.754 | 2.524 |
| 2.290221044466955 | 0.354 | 0.751 | 2.531 |
| 2.293362637120545 | 0.352 | 0.747 | 2.537 |
| 2.296504229774135 | 0.349 | 0.744 | 2.543 |
| 2.299645822427724 | 0.347 | 0.741 | 2.549 |
| 2.302787415081314 | 0.344 | 0.737 | 2.555 |
| 2.305929007734904 | 0.342 | 0.734 | 2.562 |
| 2.309070600388493 | 0.34 | 0.73 | 2.568 |
| 2.312212193042083 | 0.337 | 0.727 | 2.574 |
| 2.315353785695672 | 0.335 | 0.724 | 2.579 |
| 2.318495378349262 | 0.332 | 0.72 | 2.585 |
| 2.321636971002852 | 0.33 | 0.717 | 2.591 |
| 2.324778563656441 | 0.327 | 0.713 | 2.597 |
| 2.327920156310031 | 0.325 | 0.71 | 2.603 |
| 2.33106174896362 | 0.323 | 0.706 | 2.608 |
| 2.33420334161721 | 0.32 | 0.703 | 2.614 |
| 2.3373449342708 | 0.318 | 0.699 | 2.619 |
| 2.340486526924389 | 0.316 | 0.696 | 2.625 |
| 2.343628119577979 | 0.313 | 0.692 | 2.63 |
| 2.346769712231568 | 0.311 | 0.689 | 2.635 |
| 2.349911304885158 | 0.308 | 0.685 | 2.64 |
| 2.353052897538748 | 0.306 | 0.682 | 2.646 |
| 2.356194490192337 | 0.304 | 0.678 | 2.651 |
| 2.359336082845927 | 0.301 | 0.675 | 2.656 |
| 2.362477675499516 | 0.299 | 0.671 | 2.661 |
| 2.365619268153106 | 0.297 | 0.668 | 2.665 |
| 2.368760860806696 | 0.295 | 0.664 | 2.67 |
| 2.371902453460285 | 0.292 | 0.66 | 2.675 |
| 2.375044046113875 | 0.29 | 0.657 | 2.68 |
| 2.378185638767464 | 0.288 | 0.653 | 2.684 |
| 2.381327231421054 | 0.285 | 0.65 | 2.688 |
| 2.384468824074644 | 0.283 | 0.646 | 2.693 |
| 2.387610416728233 | 0.281 | 0.642 | 2.697 |
| 2.390752009381823 | 0.279 | 0.639 | 2.701 |
| 2.393893602035412 | 0.276 | 0.635 | 2.705 |
| 2.397035194689002 | 0.274 | 0.631 | 2.709 |
| 2.400176787342591 | 0.272 | 0.628 | 2.713 |
| 2.403318379996181 | 0.27 | 0.624 | 2.717 |
| 2.406459972649771 | 0.268 | 0.62 | 2.721 |
| 2.40960156530336 | 0.265 | 0.616 | 2.724 |
| 2.41274315795695 | 0.263 | 0.613 | 2.728 |
| 2.41588475061054 | 0.261 | 0.609 | 2.731 |
| 2.419026343264129 | 0.259 | 0.605 | 2.735 |
| 2.422167935917719 | 0.257 | 0.602 | 2.738 |
| 2.425309528571308 | 0.254 | 0.598 | 2.741 |
| 2.428451121224898 | 0.252 | 0.594 | 2.744 |
| 2.431592713878488 | 0.25 | 0.59 | 2.747 |
| 2.434734306532077 | 0.248 | 0.587 | 2.749 |
| 2.437875899185667 | 0.246 | 0.583 | 2.752 |
| 2.441017491839256 | 0.244 | 0.579 | 2.755 |
| 2.444159084492846 | 0.242 | 0.575 | 2.757 |
| 2.447300677146435 | 0.24 | 0.572 | 2.759 |
| 2.450442269800025 | 0.237 | 0.568 | 2.761 |
| 2.453583862453615 | 0.235 | 0.564 | 2.763 |
| 2.456725455107204 | 0.233 | 0.56 | 2.765 |
| 2.459867047760794 | 0.231 | 0.556 | 2.767 |
| 2.463008640414384 | 0.229 | 0.553 | 2.769 |
| 2.466150233067973 | 0.227 | 0.549 | 2.77 |
| 2.469291825721563 | 0.225 | 0.545 | 2.772 |
| 2.472433418375152 | 0.223 | 0.541 | 2.773 |
| 2.475575011028742 | 0.221 | 0.538 | 2.774 |
| 2.478716603682332 | 0.219 | 0.534 | 2.775 |
| 2.481858196335921 | 0.217 | 0.53 | 2.776 |
| 2.48499978898951 | 0.215 | 0.526 | 2.776 |
| 2.4881413816431 | 0.213 | 0.522 | 2.777 |
| 2.49128297429669 | 0.211 | 0.518 | 2.777 |
| 2.49442456695028 | 0.209 | 0.515 | 2.778 |
| 2.497566159603869 | 0.207 | 0.511 | 2.778 |
| 2.500707752257458 | 0.205 | 0.507 | 2.778 |
| 2.503849344911048 | 0.203 | 0.503 | 2.778 |
| 2.506990937564638 | 0.201 | 0.499 | 2.777 |
| 2.510132530218228 | 0.199 | 0.496 | 2.777 |
| 2.513274122871817 | 0.197 | 0.492 | 2.776 |
| 2.516415715525407 | 0.195 | 0.488 | 2.775 |
| 2.519557308178996 | 0.193 | 0.484 | 2.774 |
| 2.522698900832586 | 0.191 | 0.48 | 2.773 |
| 2.525840493486176 | 0.19 | 0.476 | 2.772 |
| 2.528982086139765 | 0.188 | 0.473 | 2.77 |
| 2.532123678793355 | 0.186 | 0.469 | 2.768 |
| 2.535265271446944 | 0.184 | 0.465 | 2.767 |
| 2.538406864100534 | 0.182 | 0.461 | 2.765 |
| 2.541548456754124 | 0.18 | 0.457 | 2.762 |
| 2.544690049407713 | 0.178 | 0.454 | 2.76 |
| 2.547831642061302 | 0.177 | 0.45 | 2.757 |
| 2.550973234714892 | 0.175 | 0.446 | 2.755 |
| 2.554114827368482 | 0.173 | 0.442 | 2.752 |
| 2.557256420022072 | 0.171 | 0.438 | 2.749 |
| 2.560398012675661 | 0.169 | 0.435 | 2.745 |
| 2.563539605329251 | 0.168 | 0.431 | 2.742 |
| 2.56668119798284 | 0.166 | 0.427 | 2.738 |
| 2.56982279063643 | 0.164 | 0.423 | 2.734 |
| 2.57296438329002 | 0.162 | 0.419 | 2.73 |
| 2.576105975943609 | 0.16 | 0.416 | 2.726 |
| 2.579247568597199 | 0.159 | 0.412 | 2.721 |
| 2.582389161250788 | 0.157 | 0.408 | 2.717 |
| 2.585530753904377 | 0.155 | 0.404 | 2.712 |
| 2.588672346557967 | 0.154 | 0.401 | 2.707 |
| 2.591813939211557 | 0.152 | 0.397 | 2.702 |
| 2.594955531865147 | 0.15 | 0.393 | 2.696 |
| 2.598097124518736 | 0.148 | 0.389 | 2.69 |
| 2.601238717172326 | 0.147 | 0.386 | 2.685 |
| 2.604380309825915 | 0.145 | 0.382 | 2.678 |
| 2.607521902479505 | 0.143 | 0.378 | 2.672 |
| 2.610663495133095 | 0.142 | 0.374 | 2.666 |
| 2.613805087786684 | 0.14 | 0.371 | 2.659 |
| 2.616946680440274 | 0.138 | 0.367 | 2.652 |
| 2.620088273093863 | 0.137 | 0.363 | 2.645 |
| 2.623229865747452 | 0.135 | 0.36 | 2.637 |
| 2.626371458401042 | 0.134 | 0.356 | 2.63 |
| 2.629513051054632 | 0.132 | 0.352 | 2.622 |
| 2.632654643708222 | 0.13 | 0.349 | 2.614 |
| 2.635796236361811 | 0.129 | 0.345 | 2.605 |
| 2.638937829015401 | 0.127 | 0.341 | 2.597 |
| 2.642079421668991 | 0.126 | 0.338 | 2.588 |
| 2.64522101432258 | 0.124 | 0.334 | 2.579 |
| 2.64836260697617 | 0.123 | 0.33 | 2.57 |
| 2.651504199629759 | 0.121 | 0.327 | 2.56 |
| 2.654645792283349 | 0.12 | 0.323 | 2.551 |
| 2.657787384936938 | 0.118 | 0.319 | 2.541 |
| 2.660928977590528 | 0.116 | 0.316 | 2.531 |
| 2.664070570244118 | 0.115 | 0.312 | 2.52 |
| 2.667212162897707 | 0.114 | 0.309 | 2.51 |
| 2.670353755551297 | 0.112 | 0.305 | 2.499 |
| 2.673495348204887 | 0.111 | 0.302 | 2.488 |
| 2.676636940858476 | 0.109 | 0.298 | 2.476 |
| 2.679778533512066 | 0.108 | 0.295 | 2.465 |
| 2.682920126165655 | 0.106 | 0.291 | 2.453 |
| 2.686061718819245 | 0.105 | 0.288 | 2.441 |
| 2.689203311472835 | 0.103 | 0.284 | 2.429 |
| 2.692344904126424 | 0.102 | 0.281 | 2.416 |
| 2.695486496780014 | 0.101 | 0.277 | 2.404 |
| 2.698628089433603 | 0.099 | 0.274 | 2.391 |
| 2.701769682087193 | 0.098 | 0.27 | 2.377 |
| 2.704911274740782 | 0.096 | 0.267 | 2.364 |
| 2.708052867394372 | 0.095 | 0.263 | 2.35 |
| 2.711194460047962 | 0.094 | 0.26 | 2.336 |
| 2.714336052701551 | 0.092 | 0.257 | 2.322 |
| 2.717477645355141 | 0.091 | 0.253 | 2.308 |
| 2.720619238008731 | 0.09 | 0.25 | 2.293 |
| 2.72376083066232 | 0.088 | 0.247 | 2.278 |
| 2.72690242331591 | 0.087 | 0.243 | 2.263 |
| 2.730044015969499 | 0.086 | 0.24 | 2.248 |
| 2.733185608623089 | 0.084 | 0.237 | 2.233 |
| 2.736327201276678 | 0.083 | 0.233 | 2.217 |
| 2.739468793930268 | 0.082 | 0.23 | 2.201 |
| 2.742610386583858 | 0.081 | 0.227 | 2.185 |
| 2.745751979237447 | 0.079 | 0.224 | 2.168 |
| 2.748893571891036 | 0.078 | 0.22 | 2.152 |
| 2.752035164544627 | 0.077 | 0.217 | 2.135 |
| 2.755176757198216 | 0.076 | 0.214 | 2.118 |
| 2.758318349851806 | 0.074 | 0.211 | 2.1 |
| 2.761459942505395 | 0.073 | 0.208 | 2.083 |
| 2.764601535158985 | 0.072 | 0.204 | 2.065 |
| 2.767743127812574 | 0.071 | 0.201 | 2.047 |
| 2.770884720466164 | 0.07 | 0.198 | 2.029 |
| 2.774026313119754 | 0.068 | 0.195 | 2.01 |
| 2.777167905773343 | 0.067 | 0.192 | 1.992 |
| 2.780309498426932 | 0.066 | 0.189 | 1.973 |
| 2.783451091080522 | 0.065 | 0.186 | 1.954 |
| 2.786592683734112 | 0.064 | 0.183 | 1.935 |
| 2.789734276387701 | 0.063 | 0.18 | 1.916 |
| 2.792875869041291 | 0.062 | 0.177 | 1.896 |
| 2.796017461694881 | 0.061 | 0.174 | 1.876 |
| 2.79915905434847 | 0.059 | 0.171 | 1.856 |
| 2.80230064700206 | 0.058 | 0.168 | 1.836 |
| 2.80544223965565 | 0.057 | 0.165 | 1.816 |
| 2.808583832309239 | 0.056 | 0.162 | 1.796 |
| 2.811725424962829 | 0.055 | 0.16 | 1.775 |
| 2.814867017616419 | 0.054 | 0.157 | 1.754 |
| 2.818008610270008 | 0.053 | 0.154 | 1.733 |
| 2.821150202923598 | 0.052 | 0.151 | 1.712 |
| 2.824291795577187 | 0.051 | 0.148 | 1.691 |
| 2.827433388230777 | 0.05 | 0.146 | 1.67 |
| 2.830574980884366 | 0.049 | 0.143 | 1.648 |
| 2.833716573537956 | 0.048 | 0.14 | 1.626 |
| 2.836858166191546 | 0.047 | 0.137 | 1.605 |
| 2.839999758845135 | 0.046 | 0.135 | 1.583 |
| 2.843141351498725 | 0.045 | 0.132 | 1.561 |
| 2.846282944152314 | 0.044 | 0.13 | 1.539 |
| 2.849424536805904 | 0.043 | 0.127 | 1.516 |
| 2.852566129459494 | 0.042 | 0.124 | 1.494 |
| 2.855707722113083 | 0.042 | 0.122 | 1.472 |
| 2.858849314766673 | 0.041 | 0.119 | 1.449 |
| 2.861990907420262 | 0.04 | 0.117 | 1.426 |
| 2.865132500073852 | 0.039 | 0.114 | 1.404 |
| 2.868274092727442 | 0.038 | 0.112 | 1.381 |
| 2.871415685381031 | 0.037 | 0.109 | 1.358 |
| 2.874557278034621 | 0.036 | 0.107 | 1.335 |
| 2.87769887068821 | 0.035 | 0.104 | 1.312 |
| 2.8808404633418 | 0.035 | 0.102 | 1.289 |
| 2.88398205599539 | 0.034 | 0.1 | 1.266 |
| 2.88712364864898 | 0.033 | 0.097 | 1.243 |
| 2.890265241302569 | 0.032 | 0.095 | 1.22 |
| 2.893406833956158 | 0.031 | 0.093 | 1.197 |
| 2.896548426609748 | 0.031 | 0.091 | 1.174 |
| 2.899690019263338 | 0.03 | 0.088 | 1.151 |
| 2.902831611916927 | 0.029 | 0.086 | 1.128 |
| 2.905973204570517 | 0.028 | 0.084 | 1.105 |
| 2.909114797224106 | 0.028 | 0.082 | 1.082 |
| 2.912256389877696 | 0.027 | 0.08 | 1.059 |
| 2.915397982531286 | 0.026 | 0.078 | 1.036 |
| 2.918539575184875 | 0.025 | 0.076 | 1.013 |
| 2.921681167838465 | 0.025 | 0.073 | 0.99 |
| 2.924822760492054 | 0.024 | 0.071 | 0.967 |
| 2.927964353145644 | 0.023 | 0.069 | 0.944 |
| 2.931105945799234 | 0.023 | 0.067 | 0.921 |
| 2.934247538452823 | 0.022 | 0.066 | 0.899 |
| 2.937389131106413 | 0.021 | 0.064 | 0.876 |
| 2.940530723760002 | 0.021 | 0.062 | 0.854 |
| 2.943672316413592 | 0.02 | 0.06 | 0.832 |
| 2.946813909067182 | 0.019 | 0.058 | 0.809 |
| 2.949955501720771 | 0.019 | 0.056 | 0.787 |
| 2.953097094374361 | 0.018 | 0.054 | 0.765 |
| 2.95623868702795 | 0.017 | 0.053 | 0.744 |
| 2.95938027968154 | 0.017 | 0.051 | 0.722 |
| 2.96252187233513 | 0.016 | 0.049 | 0.701 |
| 2.965663464988719 | 0.016 | 0.047 | 0.679 |
| 2.968805057642309 | 0.015 | 0.046 | 0.658 |
| 2.971946650295898 | 0.015 | 0.044 | 0.637 |
| 2.975088242949488 | 0.014 | 0.043 | 0.617 |
| 2.978229835603078 | 0.014 | 0.041 | 0.596 |
| 2.981371428256667 | 0.013 | 0.04 | 0.576 |
| 2.984513020910257 | 0.013 | 0.038 | 0.556 |
| 2.987654613563846 | 0.012 | 0.037 | 0.536 |
| 2.990796206217436 | 0.012 | 0.035 | 0.516 |
| 2.993937798871025 | 0.011 | 0.034 | 0.497 |
| 2.997079391524615 | 0.011 | 0.032 | 0.478 |
| 3.000220984178205 | 0.01 | 0.031 | 0.459 |
| 3.003362576831794 | 0.01 | 0.03 | 0.44 |
| 3.006504169485384 | 0.009 | 0.028 | 0.422 |
| 3.009645762138974 | 0.009 | 0.027 | 0.404 |
| 3.012787354792563 | 0.008 | 0.026 | 0.386 |
| 3.015928947446153 | 0.008 | 0.024 | 0.369 |
| 3.019070540099742 | 0.008 | 0.023 | 0.352 |
| 3.022212132753332 | 0.007 | 0.022 | 0.335 |
| 3.025353725406922 | 0.007 | 0.021 | 0.319 |
| 3.028495318060511 | 0.007 | 0.02 | 0.303 |
| 3.031636910714101 | 0.006 | 0.019 | 0.287 |
| 3.03477850336769 | 0.006 | 0.018 | 0.272 |
| 3.03792009602128 | 0.005 | 0.017 | 0.257 |
| 3.04106168867487 | 0.005 | 0.016 | 0.242 |
| 3.04420328132846 | 0.005 | 0.015 | 0.228 |
| 3.047344873982049 | 0.005 | 0.014 | 0.214 |
| 3.050486466635638 | 0.004 | 0.013 | 0.2 |
| 3.053628059289228 | 0.004 | 0.012 | 0.187 |
| 3.056769651942818 | 0.004 | 0.011 | 0.174 |
| 3.059911244596407 | 0.003 | 0.01 | 0.162 |
| 3.063052837249997 | 0.003 | 0.01 | 0.15 |
| 3.066194429903586 | 0.003 | 0.009 | 0.139 |
| 3.069336022557176 | 0.003 | 0.008 | 0.128 |
| 3.072477615210766 | 0.002 | 0.007 | 0.117 |
| 3.075619207864355 | 0.002 | 0.007 | 0.107 |
| 3.078760800517945 | 0.002 | 0.006 | 0.097 |
| 3.081902393171534 | 0.002 | 0.006 | 0.088 |
| 3.085043985825124 | 0.002 | 0.005 | 0.079 |
| 3.088185578478713 | 0.001 | 0.004 | 0.07 |
| 3.091327171132303 | 0.001 | 0.004 | 0.062 |
| 3.094468763785893 | 0.001 | 0.003 | 0.055 |
| 3.097610356439482 | 0.001 | 0.003 | 0.048 |
| 3.100751949093072 | 0.001 | 0.003 | 0.041 |
| 3.103893541746661 | 0.001 | 0.002 | 0.035 |
| 3.107035134400251 | 0.001 | 0.002 | 0.03 |
| 3.110176727053841 | 0.001 | 0.002 | 0.025 |
| 3.11331831970743 | 0 | 0.001 | 0.02 |
| 3.11645991236102 | 0 | 0.001 | 0.016 |
| 3.11960150501461 | 0 | 0.001 | 0.012 |
| 3.122743097668199 | 0 | 0.001 | 0.009 |
| 3.125884690321789 | 0 | 0 | 0.006 |
| 3.129026282975378 | 0 | 0 | 0.004 |
| 3.132167875628968 | 0 | 0 | 0.002 |
| 3.135309468282557 | 0 | 0 | 0.001 |
| 3.138451060936147 | 0 | 0 | 0 |
| 3.141592653589737 | 0 | 0 | 0 |
| 3.144734246243326 | 0 | 0 | 0 |
| 3.147875838896916 | 0 | 0 | 0.001 |
| 3.151017431550505 | 0 | 0 | 0.002 |
| 3.154159024204095 | 0 | 0 | 0.004 |
| 3.157300616857685 | 0 | 0 | 0.006 |
| 3.160442209511274 | 0 | 0.001 | 0.009 |
| 3.163583802164864 | 0 | 0.001 | 0.012 |
| 3.166725394818453 | 0 | 0.001 | 0.016 |
| 3.169866987472043 | 0 | 0.001 | 0.02 |
| 3.173008580125633 | 0.001 | 0.002 | 0.025 |
| 3.176150172779222 | 0.001 | 0.002 | 0.03 |
| 3.179291765432812 | 0.001 | 0.002 | 0.035 |
| 3.182433358086401 | 0.001 | 0.003 | 0.041 |
| 3.185574950739991 | 0.001 | 0.003 | 0.048 |
| 3.188716543393581 | 0.001 | 0.003 | 0.055 |
| 3.19185813604717 | 0.001 | 0.004 | 0.062 |
| 3.19499972870076 | 0.001 | 0.004 | 0.07 |
| 3.198141321354349 | 0.002 | 0.005 | 0.079 |
| 3.20128291400794 | 0.002 | 0.006 | 0.088 |
| 3.204424506661528 | 0.002 | 0.006 | 0.097 |
| 3.207566099315118 | 0.002 | 0.007 | 0.107 |
| 3.210707691968708 | 0.002 | 0.007 | 0.117 |
| 3.213849284622297 | 0.003 | 0.008 | 0.128 |
| 3.216990877275887 | 0.003 | 0.009 | 0.139 |
| 3.220132469929476 | 0.003 | 0.01 | 0.15 |
| 3.223274062583066 | 0.003 | 0.01 | 0.162 |
| 3.226415655236656 | 0.004 | 0.011 | 0.174 |
| 3.229557247890245 | 0.004 | 0.012 | 0.187 |
| 3.232698840543835 | 0.004 | 0.013 | 0.2 |
| 3.235840433197425 | 0.005 | 0.014 | 0.214 |
| 3.238982025851014 | 0.005 | 0.015 | 0.228 |
| 3.242123618504604 | 0.005 | 0.016 | 0.242 |
| 3.245265211158193 | 0.005 | 0.017 | 0.257 |
| 3.248406803811783 | 0.006 | 0.018 | 0.272 |
| 3.251548396465373 | 0.006 | 0.019 | 0.287 |
| 3.254689989118962 | 0.007 | 0.02 | 0.303 |
| 3.257831581772551 | 0.007 | 0.021 | 0.319 |
| 3.260973174426141 | 0.007 | 0.022 | 0.335 |
| 3.26411476707973 | 0.008 | 0.023 | 0.352 |
| 3.267256359733321 | 0.008 | 0.024 | 0.369 |
| 3.27039795238691 | 0.008 | 0.026 | 0.386 |
| 3.2735395450405 | 0.009 | 0.027 | 0.404 |
| 3.276681137694089 | 0.009 | 0.028 | 0.422 |
| 3.279822730347679 | 0.01 | 0.03 | 0.44 |
| 3.282964323001269 | 0.01 | 0.031 | 0.459 |
| 3.286105915654858 | 0.011 | 0.032 | 0.478 |
| 3.289247508308448 | 0.011 | 0.034 | 0.497 |
| 3.292389100962037 | 0.012 | 0.035 | 0.516 |
| 3.295530693615627 | 0.012 | 0.037 | 0.536 |
| 3.298672286269217 | 0.013 | 0.038 | 0.556 |
| 3.301813878922806 | 0.013 | 0.04 | 0.576 |
| 3.304955471576396 | 0.014 | 0.041 | 0.596 |
| 3.308097064229985 | 0.014 | 0.043 | 0.617 |
| 3.311238656883575 | 0.015 | 0.044 | 0.637 |
| 3.314380249537165 | 0.015 | 0.046 | 0.658 |
| 3.317521842190754 | 0.016 | 0.047 | 0.679 |
| 3.320663434844344 | 0.016 | 0.049 | 0.701 |
| 3.323805027497933 | 0.017 | 0.051 | 0.722 |
| 3.326946620151523 | 0.017 | 0.053 | 0.744 |
| 3.330088212805113 | 0.018 | 0.054 | 0.765 |
| 3.333229805458702 | 0.019 | 0.056 | 0.787 |
| 3.336371398112292 | 0.019 | 0.058 | 0.809 |
| 3.339512990765881 | 0.02 | 0.06 | 0.832 |
| 3.342654583419471 | 0.021 | 0.062 | 0.854 |
| 3.345796176073061 | 0.021 | 0.064 | 0.876 |
| 3.34893776872665 | 0.022 | 0.066 | 0.899 |
| 3.35207936138024 | 0.023 | 0.067 | 0.921 |
| 3.355220954033829 | 0.023 | 0.069 | 0.944 |
| 3.358362546687419 | 0.024 | 0.071 | 0.967 |
| 3.361504139341009 | 0.025 | 0.073 | 0.99 |
| 3.364645731994598 | 0.025 | 0.076 | 1.013 |
| 3.367787324648188 | 0.026 | 0.078 | 1.036 |
| 3.370928917301777 | 0.027 | 0.08 | 1.059 |
| 3.374070509955367 | 0.028 | 0.082 | 1.082 |
| 3.377212102608956 | 0.028 | 0.084 | 1.105 |
| 3.380353695262546 | 0.029 | 0.086 | 1.128 |
| 3.383495287916136 | 0.03 | 0.088 | 1.151 |
| 3.386636880569725 | 0.031 | 0.091 | 1.174 |
| 3.389778473223315 | 0.031 | 0.093 | 1.197 |
| 3.392920065876904 | 0.032 | 0.095 | 1.22 |
| 3.396061658530494 | 0.033 | 0.097 | 1.243 |
| 3.399203251184084 | 0.034 | 0.1 | 1.266 |
| 3.402344843837673 | 0.035 | 0.102 | 1.289 |
| 3.405486436491263 | 0.035 | 0.104 | 1.312 |
| 3.408628029144852 | 0.036 | 0.107 | 1.335 |
| 3.411769621798442 | 0.037 | 0.109 | 1.358 |
| 3.414911214452032 | 0.038 | 0.112 | 1.381 |
| 3.418052807105621 | 0.039 | 0.114 | 1.404 |
| 3.421194399759211 | 0.04 | 0.117 | 1.426 |
| 3.4243359924128 | 0.041 | 0.119 | 1.449 |
| 3.42747758506639 | 0.042 | 0.122 | 1.472 |
| 3.43061917771998 | 0.042 | 0.124 | 1.494 |
| 3.433760770373569 | 0.043 | 0.127 | 1.516 |
| 3.436902363027159 | 0.044 | 0.13 | 1.539 |
| 3.440043955680748 | 0.045 | 0.132 | 1.561 |
| 3.443185548334338 | 0.046 | 0.135 | 1.583 |
| 3.446327140987927 | 0.047 | 0.137 | 1.605 |
| 3.449468733641517 | 0.048 | 0.14 | 1.626 |
| 3.452610326295107 | 0.049 | 0.143 | 1.648 |
| 3.455751918948696 | 0.05 | 0.146 | 1.67 |
| 3.458893511602286 | 0.051 | 0.148 | 1.691 |
| 3.462035104255876 | 0.052 | 0.151 | 1.712 |
| 3.465176696909465 | 0.053 | 0.154 | 1.733 |
| 3.468318289563055 | 0.054 | 0.157 | 1.754 |
| 3.471459882216644 | 0.055 | 0.16 | 1.775 |
| 3.474601474870234 | 0.056 | 0.162 | 1.796 |
| 3.477743067523824 | 0.057 | 0.165 | 1.816 |
| 3.480884660177413 | 0.058 | 0.168 | 1.836 |
| 3.484026252831002 | 0.059 | 0.171 | 1.856 |
| 3.487167845484592 | 0.061 | 0.174 | 1.876 |
| 3.490309438138182 | 0.062 | 0.177 | 1.896 |
| 3.493451030791772 | 0.063 | 0.18 | 1.916 |
| 3.496592623445361 | 0.064 | 0.183 | 1.935 |
| 3.499734216098951 | 0.065 | 0.186 | 1.954 |
| 3.50287580875254 | 0.066 | 0.189 | 1.973 |
| 3.50601740140613 | 0.067 | 0.192 | 1.992 |
| 3.50915899405972 | 0.068 | 0.195 | 2.01 |
| 3.512300586713309 | 0.07 | 0.198 | 2.029 |
| 3.515442179366899 | 0.071 | 0.201 | 2.047 |
| 3.518583772020488 | 0.072 | 0.204 | 2.065 |
| 3.521725364674078 | 0.073 | 0.208 | 2.083 |
| 3.524866957327668 | 0.074 | 0.211 | 2.1 |
| 3.528008549981257 | 0.076 | 0.214 | 2.118 |
| 3.531150142634847 | 0.077 | 0.217 | 2.135 |
| 3.534291735288436 | 0.078 | 0.22 | 2.152 |
| 3.537433327942026 | 0.079 | 0.224 | 2.168 |
| 3.540574920595616 | 0.081 | 0.227 | 2.185 |
| 3.543716513249205 | 0.082 | 0.23 | 2.201 |
| 3.546858105902795 | 0.083 | 0.233 | 2.217 |
| 3.549999698556384 | 0.084 | 0.237 | 2.233 |
| 3.553141291209974 | 0.086 | 0.24 | 2.248 |
| 3.556282883863564 | 0.087 | 0.243 | 2.263 |
| 3.559424476517153 | 0.088 | 0.247 | 2.278 |
| 3.562566069170743 | 0.09 | 0.25 | 2.293 |
| 3.565707661824332 | 0.091 | 0.253 | 2.308 |
| 3.568849254477922 | 0.092 | 0.257 | 2.322 |
| 3.571990847131511 | 0.094 | 0.26 | 2.336 |
| 3.575132439785101 | 0.095 | 0.263 | 2.35 |
| 3.578274032438691 | 0.096 | 0.267 | 2.364 |
| 3.58141562509228 | 0.098 | 0.27 | 2.377 |
| 3.58455721774587 | 0.099 | 0.274 | 2.391 |
| 3.58769881039946 | 0.101 | 0.277 | 2.404 |
| 3.590840403053049 | 0.102 | 0.281 | 2.416 |
| 3.593981995706639 | 0.103 | 0.284 | 2.429 |
| 3.597123588360228 | 0.105 | 0.288 | 2.441 |
| 3.600265181013818 | 0.106 | 0.291 | 2.453 |
| 3.603406773667407 | 0.108 | 0.295 | 2.465 |
| 3.606548366320997 | 0.109 | 0.298 | 2.476 |
| 3.609689958974587 | 0.111 | 0.302 | 2.488 |
| 3.612831551628176 | 0.112 | 0.305 | 2.499 |
| 3.615973144281766 | 0.114 | 0.309 | 2.51 |
| 3.619114736935355 | 0.115 | 0.312 | 2.52 |
| 3.622256329588945 | 0.116 | 0.316 | 2.531 |
| 3.625397922242534 | 0.118 | 0.319 | 2.541 |
| 3.628539514896124 | 0.12 | 0.323 | 2.551 |
| 3.631681107549714 | 0.121 | 0.327 | 2.56 |
| 3.634822700203303 | 0.123 | 0.33 | 2.57 |
| 3.637964292856893 | 0.124 | 0.334 | 2.579 |
| 3.641105885510483 | 0.126 | 0.338 | 2.588 |
| 3.644247478164072 | 0.127 | 0.341 | 2.597 |
| 3.647389070817662 | 0.129 | 0.345 | 2.605 |
| 3.650530663471251 | 0.13 | 0.349 | 2.614 |
| 3.653672256124841 | 0.132 | 0.352 | 2.622 |
| 3.656813848778431 | 0.134 | 0.356 | 2.63 |
| 3.65995544143202 | 0.135 | 0.36 | 2.637 |
| 3.66309703408561 | 0.137 | 0.363 | 2.645 |
| 3.666238626739199 | 0.138 | 0.367 | 2.652 |
| 3.66938021939279 | 0.14 | 0.371 | 2.659 |
| 3.672521812046378 | 0.142 | 0.374 | 2.666 |
| 3.675663404699968 | 0.143 | 0.378 | 2.672 |
| 3.678804997353558 | 0.145 | 0.382 | 2.678 |
| 3.681946590007147 | 0.147 | 0.386 | 2.685 |
| 3.685088182660737 | 0.148 | 0.389 | 2.69 |
| 3.688229775314326 | 0.15 | 0.393 | 2.696 |
| 3.691371367967916 | 0.152 | 0.397 | 2.702 |
| 3.694512960621506 | 0.154 | 0.401 | 2.707 |
| 3.697654553275095 | 0.155 | 0.404 | 2.712 |
| 3.700796145928685 | 0.157 | 0.408 | 2.717 |
| 3.703937738582274 | 0.159 | 0.412 | 2.721 |
| 3.707079331235864 | 0.16 | 0.416 | 2.726 |
| 3.710220923889454 | 0.162 | 0.419 | 2.73 |
| 3.713362516543043 | 0.164 | 0.423 | 2.734 |
| 3.716504109196633 | 0.166 | 0.427 | 2.738 |
| 3.719645701850223 | 0.168 | 0.431 | 2.742 |
| 3.722787294503812 | 0.169 | 0.435 | 2.745 |
| 3.725928887157402 | 0.171 | 0.438 | 2.749 |
| 3.729070479810991 | 0.173 | 0.442 | 2.752 |
| 3.732212072464581 | 0.175 | 0.446 | 2.755 |
| 3.735353665118171 | 0.177 | 0.45 | 2.757 |
| 3.73849525777176 | 0.178 | 0.454 | 2.76 |
| 3.74163685042535 | 0.18 | 0.457 | 2.762 |
| 3.744778443078939 | 0.182 | 0.461 | 2.765 |
| 3.747920035732529 | 0.184 | 0.465 | 2.767 |
| 3.751061628386119 | 0.186 | 0.469 | 2.768 |
| 3.754203221039708 | 0.188 | 0.473 | 2.77 |
| 3.757344813693298 | 0.19 | 0.476 | 2.772 |
| 3.760486406346887 | 0.191 | 0.48 | 2.773 |
| 3.763627999000477 | 0.193 | 0.484 | 2.774 |
| 3.766769591654067 | 0.195 | 0.488 | 2.775 |
| 3.769911184307656 | 0.197 | 0.492 | 2.776 |
| 3.773052776961246 | 0.199 | 0.496 | 2.777 |
| 3.776194369614835 | 0.201 | 0.499 | 2.777 |
| 3.779335962268425 | 0.203 | 0.503 | 2.778 |
| 3.782477554922014 | 0.205 | 0.507 | 2.778 |
| 3.785619147575604 | 0.207 | 0.511 | 2.778 |
| 3.788760740229193 | 0.209 | 0.515 | 2.778 |
| 3.791902332882783 | 0.211 | 0.518 | 2.777 |
| 3.795043925536373 | 0.213 | 0.522 | 2.777 |
| 3.798185518189962 | 0.215 | 0.526 | 2.776 |
| 3.801327110843552 | 0.217 | 0.53 | 2.776 |
| 3.804468703497142 | 0.219 | 0.534 | 2.775 |
| 3.807610296150731 | 0.221 | 0.538 | 2.774 |
| 3.810751888804321 | 0.223 | 0.541 | 2.773 |
| 3.813893481457911 | 0.225 | 0.545 | 2.772 |
| 3.8170350741115 | 0.227 | 0.549 | 2.77 |
| 3.82017666676509 | 0.229 | 0.553 | 2.769 |
| 3.823318259418679 | 0.231 | 0.556 | 2.767 |
| 3.826459852072269 | 0.233 | 0.56 | 2.765 |
| 3.829601444725859 | 0.235 | 0.564 | 2.763 |
| 3.832743037379448 | 0.237 | 0.568 | 2.761 |
| 3.835884630033038 | 0.24 | 0.572 | 2.759 |
| 3.839026222686627 | 0.242 | 0.575 | 2.757 |
| 3.842167815340217 | 0.244 | 0.579 | 2.755 |
| 3.845309407993807 | 0.246 | 0.583 | 2.752 |
| 3.848451000647396 | 0.248 | 0.587 | 2.749 |
| 3.851592593300986 | 0.25 | 0.59 | 2.747 |
| 3.854734185954575 | 0.252 | 0.594 | 2.744 |
| 3.857875778608165 | 0.254 | 0.598 | 2.741 |
| 3.861017371261755 | 0.257 | 0.602 | 2.738 |
| 3.864158963915344 | 0.259 | 0.605 | 2.735 |
| 3.867300556568933 | 0.261 | 0.609 | 2.731 |
| 3.870442149222523 | 0.263 | 0.613 | 2.728 |
| 3.873583741876112 | 0.265 | 0.616 | 2.724 |
| 3.876725334529703 | 0.268 | 0.62 | 2.721 |
| 3.879866927183292 | 0.27 | 0.624 | 2.717 |
| 3.883008519836882 | 0.272 | 0.628 | 2.713 |
| 3.886150112490471 | 0.274 | 0.631 | 2.709 |
| 3.889291705144061 | 0.276 | 0.635 | 2.705 |
| 3.892433297797651 | 0.279 | 0.639 | 2.701 |
| 3.89557489045124 | 0.281 | 0.642 | 2.697 |
| 3.89871648310483 | 0.283 | 0.646 | 2.693 |
| 3.901858075758419 | 0.285 | 0.65 | 2.688 |
| 3.904999668412009 | 0.288 | 0.653 | 2.684 |
| 3.908141261065598 | 0.29 | 0.657 | 2.68 |
| 3.911282853719188 | 0.292 | 0.66 | 2.675 |
| 3.914424446372778 | 0.295 | 0.664 | 2.67 |
| 3.917566039026367 | 0.297 | 0.668 | 2.665 |
| 3.920707631679957 | 0.299 | 0.671 | 2.661 |
| 3.923849224333547 | 0.301 | 0.675 | 2.656 |
| 3.926990816987136 | 0.304 | 0.678 | 2.651 |
| 3.930132409640726 | 0.306 | 0.682 | 2.646 |
| 3.933274002294315 | 0.308 | 0.685 | 2.64 |
| 3.936415594947905 | 0.311 | 0.689 | 2.635 |
| 3.939557187601495 | 0.313 | 0.692 | 2.63 |
| 3.942698780255084 | 0.316 | 0.696 | 2.625 |
| 3.945840372908674 | 0.318 | 0.699 | 2.619 |
| 3.948981965562263 | 0.32 | 0.703 | 2.614 |
| 3.952123558215853 | 0.323 | 0.706 | 2.608 |
| 3.955265150869442 | 0.325 | 0.71 | 2.603 |
| 3.958406743523032 | 0.327 | 0.713 | 2.597 |
| 3.961548336176622 | 0.33 | 0.717 | 2.591 |
| 3.964689928830211 | 0.332 | 0.72 | 2.585 |
| 3.967831521483801 | 0.335 | 0.724 | 2.579 |
| 3.97097311413739 | 0.337 | 0.727 | 2.574 |
| 3.97411470679098 | 0.34 | 0.73 | 2.568 |
| 3.97725629944457 | 0.342 | 0.734 | 2.562 |
| 3.98039789209816 | 0.344 | 0.737 | 2.555 |
| 3.983539484751749 | 0.347 | 0.741 | 2.549 |
| 3.986681077405338 | 0.349 | 0.744 | 2.543 |
| 3.989822670058928 | 0.352 | 0.747 | 2.537 |
| 3.992964262712517 | 0.354 | 0.751 | 2.531 |
| 3.996105855366107 | 0.357 | 0.754 | 2.524 |
| 3.999247448019697 | 0.359 | 0.757 | 2.518 |
| 4.002389040673287 | 0.362 | 0.76 | 2.511 |
| 4.005530633326877 | 0.364 | 0.764 | 2.505 |
| 4.008672225980466 | 0.367 | 0.767 | 2.499 |
| 4.011813818634056 | 0.369 | 0.77 | 2.492 |
| 4.014955411287645 | 0.372 | 0.773 | 2.485 |
| 4.018097003941234 | 0.374 | 0.777 | 2.479 |
| 4.021238596594824 | 0.377 | 0.78 | 2.472 |
| 4.024380189248414 | 0.38 | 0.783 | 2.465 |
| 4.027521781902004 | 0.382 | 0.786 | 2.459 |
| 4.030663374555593 | 0.385 | 0.789 | 2.452 |
| 4.033804967209183 | 0.387 | 0.792 | 2.445 |
| 4.036946559862773 | 0.39 | 0.796 | 2.438 |
| 4.040088152516362 | 0.392 | 0.799 | 2.431 |
| 4.043229745169951 | 0.395 | 0.802 | 2.424 |
| 4.046371337823541 | 0.397 | 0.805 | 2.417 |
| 4.049512930477131 | 0.4 | 0.808 | 2.41 |
| 4.05265452313072 | 0.403 | 0.811 | 2.403 |
| 4.05579611578431 | 0.405 | 0.814 | 2.396 |
| 4.0589377084379 | 0.408 | 0.817 | 2.389 |
| 4.062079301091489 | 0.411 | 0.82 | 2.382 |
| 4.065220893745079 | 0.413 | 0.823 | 2.375 |
| 4.068362486398668 | 0.416 | 0.826 | 2.368 |
| 4.071504079052258 | 0.418 | 0.829 | 2.361 |
| 4.074645671705848 | 0.421 | 0.832 | 2.354 |
| 4.077787264359437 | 0.424 | 0.835 | 2.347 |
| 4.080928857013027 | 0.426 | 0.838 | 2.339 |
| 4.084070449666616 | 0.429 | 0.841 | 2.332 |
| 4.087212042320206 | 0.432 | 0.843 | 2.325 |
| 4.090353634973795 | 0.434 | 0.846 | 2.317 |
| 4.093495227627385 | 0.437 | 0.849 | 2.31 |
| 4.096636820280975 | 0.44 | 0.852 | 2.303 |
| 4.099778412934564 | 0.442 | 0.855 | 2.296 |
| 4.102920005588154 | 0.445 | 0.857 | 2.288 |
| 4.106061598241744 | 0.448 | 0.86 | 2.281 |
| 4.109203190895333 | 0.451 | 0.863 | 2.273 |
| 4.112344783548923 | 0.453 | 0.866 | 2.266 |
| 4.115486376202512 | 0.456 | 0.868 | 2.259 |
| 4.118627968856102 | 0.459 | 0.871 | 2.251 |
| 4.121769561509692 | 0.461 | 0.874 | 2.244 |
| 4.124911154163281 | 0.464 | 0.876 | 2.236 |
| 4.128052746816871 | 0.467 | 0.879 | 2.229 |
| 4.13119433947046 | 0.47 | 0.882 | 2.221 |
| 4.13433593212405 | 0.472 | 0.884 | 2.214 |
| 4.13747752477764 | 0.475 | 0.887 | 2.206 |
| 4.14061911743123 | 0.478 | 0.889 | 2.199 |
| 4.143760710084818 | 0.481 | 0.892 | 2.191 |
| 4.146902302738408 | 0.483 | 0.894 | 2.184 |
| 4.150043895391998 | 0.486 | 0.897 | 2.176 |
| 4.153185488045588 | 0.489 | 0.899 | 2.169 |
| 4.156327080699177 | 0.492 | 0.902 | 2.161 |
| 4.159468673352766 | 0.495 | 0.904 | 2.154 |
| 4.162610266006356 | 0.497 | 0.907 | 2.146 |
| 4.165751858659946 | 0.5 | 0.909 | 2.139 |
| 4.168893451313535 | 0.503 | 0.911 | 2.131 |
| 4.172035043967125 | 0.506 | 0.914 | 2.124 |
| 4.175176636620715 | 0.509 | 0.916 | 2.116 |
| 4.178318229274304 | 0.511 | 0.918 | 2.109 |
| 4.181459821927894 | 0.514 | 0.921 | 2.101 |
| 4.184601414581484 | 0.517 | 0.923 | 2.093 |
| 4.187743007235073 | 0.52 | 0.925 | 2.086 |
| 4.190884599888663 | 0.523 | 0.927 | 2.078 |
| 4.194026192542252 | 0.526 | 0.93 | 2.071 |
| 4.197167785195842 | 0.528 | 0.932 | 2.063 |
| 4.200309377849432 | 0.531 | 0.934 | 2.056 |
| 4.203450970503021 | 0.534 | 0.936 | 2.048 |
| 4.206592563156611 | 0.537 | 0.938 | 2.041 |
| 4.2097341558102 | 0.54 | 0.94 | 2.033 |
| 4.21287574846379 | 0.543 | 0.942 | 2.025 |
| 4.21601734111738 | 0.546 | 0.945 | 2.018 |
| 4.21915893377097 | 0.548 | 0.947 | 2.01 |
| 4.222300526424559 | 0.551 | 0.949 | 2.003 |
| 4.225442119078148 | 0.554 | 0.951 | 1.995 |
| 4.228583711731738 | 0.557 | 0.953 | 1.988 |
| 4.231725304385327 | 0.56 | 0.955 | 1.98 |
| 4.234866897038917 | 0.563 | 0.957 | 1.973 |
| 4.238008489692506 | 0.566 | 0.958 | 1.965 |
| 4.241150082346096 | 0.569 | 0.96 | 1.958 |
| 4.244291674999685 | 0.572 | 0.962 | 1.95 |
| 4.247433267653276 | 0.574 | 0.964 | 1.943 |
| 4.250574860306865 | 0.577 | 0.966 | 1.935 |
| 4.253716452960455 | 0.58 | 0.968 | 1.928 |
| 4.256858045614044 | 0.583 | 0.97 | 1.92 |
| 4.259999638267634 | 0.586 | 0.971 | 1.913 |
| 4.263141230921224 | 0.589 | 0.973 | 1.905 |
| 4.266282823574813 | 0.592 | 0.975 | 1.898 |
| 4.269424416228403 | 0.595 | 0.977 | 1.89 |
| 4.272566008881992 | 0.598 | 0.978 | 1.883 |
| 4.275707601535582 | 0.601 | 0.98 | 1.876 |
| 4.27884919418917 | 0.604 | 0.982 | 1.868 |
| 4.28199078684276 | 0.607 | 0.983 | 1.861 |
| 4.285132379496351 | 0.609 | 0.985 | 1.853 |
| 4.28827397214994 | 0.612 | 0.986 | 1.846 |
| 4.29141556480353 | 0.615 | 0.988 | 1.839 |
| 4.294557157457119 | 0.618 | 0.989 | 1.831 |
| 4.29769875011071 | 0.621 | 0.991 | 1.824 |
| 4.300840342764299 | 0.624 | 0.992 | 1.817 |
| 4.303981935417888 | 0.627 | 0.994 | 1.809 |
| 4.307123528071478 | 0.63 | 0.995 | 1.802 |
| 4.310265120725067 | 0.633 | 0.997 | 1.795 |
| 4.313406713378657 | 0.636 | 0.998 | 1.787 |
| 4.316548306032247 | 0.639 | 1 | 1.78 |
| 4.319689898685836 | 0.642 | 1.001 | 1.773 |
| 4.322831491339426 | 0.645 | 1.002 | 1.766 |
| 4.325973083993015 | 0.648 | 1.004 | 1.758 |
| 4.329114676646605 | 0.651 | 1.005 | 1.751 |
| 4.332256269300195 | 0.654 | 1.006 | 1.744 |
| 4.335397861953784 | 0.657 | 1.007 | 1.737 |
| 4.338539454607374 | 0.66 | 1.009 | 1.73 |
| 4.341681047260963 | 0.663 | 1.01 | 1.723 |
| 4.344822639914553 | 0.666 | 1.011 | 1.715 |
| 4.347964232568143 | 0.669 | 1.012 | 1.708 |
| 4.351105825221732 | 0.672 | 1.013 | 1.701 |
| 4.354247417875322 | 0.675 | 1.014 | 1.694 |
| 4.357389010528911 | 0.678 | 1.015 | 1.687 |
| 4.360530603182501 | 0.681 | 1.017 | 1.68 |
| 4.36367219583609 | 0.684 | 1.018 | 1.673 |
| 4.36681378848968 | 0.687 | 1.019 | 1.666 |
| 4.36995538114327 | 0.69 | 1.02 | 1.659 |
| 4.373096973796859 | 0.693 | 1.021 | 1.652 |
| 4.376238566450449 | 0.696 | 1.022 | 1.645 |
| 4.379380159104038 | 0.699 | 1.022 | 1.638 |
| 4.382521751757628 | 0.702 | 1.023 | 1.631 |
| 4.385663344411217 | 0.705 | 1.024 | 1.624 |
| 4.388804937064807 | 0.707 | 1.025 | 1.617 |
| 4.391946529718397 | 0.71 | 1.026 | 1.61 |
| 4.395088122371987 | 0.713 | 1.027 | 1.603 |
| 4.398229715025576 | 0.716 | 1.028 | 1.596 |
| 4.401371307679165 | 0.719 | 1.028 | 1.589 |
| 4.404512900332755 | 0.722 | 1.029 | 1.582 |
| 4.407654492986345 | 0.725 | 1.03 | 1.576 |
| 4.410796085639934 | 0.728 | 1.031 | 1.569 |
| 4.413937678293524 | 0.731 | 1.031 | 1.562 |
| 4.417079270947114 | 0.734 | 1.032 | 1.555 |
| 4.420220863600703 | 0.737 | 1.033 | 1.548 |
| 4.423362456254293 | 0.74 | 1.033 | 1.542 |
| 4.426504048907883 | 0.743 | 1.034 | 1.535 |
| 4.429645641561472 | 0.746 | 1.034 | 1.528 |
| 4.432787234215062 | 0.749 | 1.035 | 1.522 |
| 4.435928826868651 | 0.752 | 1.035 | 1.515 |
| 4.43907041952224 | 0.755 | 1.036 | 1.508 |
| 4.44221201217583 | 0.758 | 1.036 | 1.502 |
| 4.44535360482942 | 0.761 | 1.037 | 1.495 |
| 4.44849519748301 | 0.764 | 1.037 | 1.488 |
| 4.4516367901366 | 0.767 | 1.038 | 1.482 |
| 4.454778382790188 | 0.77 | 1.038 | 1.475 |
| 4.457919975443779 | 0.773 | 1.039 | 1.469 |
| 4.461061568097368 | 0.776 | 1.039 | 1.462 |
| 4.464203160750958 | 0.779 | 1.039 | 1.456 |
| 4.467344753404547 | 0.782 | 1.04 | 1.449 |
| 4.470486346058137 | 0.785 | 1.04 | 1.443 |
| 4.473627938711726 | 0.788 | 1.04 | 1.436 |
| 4.476769531365316 | 0.791 | 1.04 | 1.43 |
| 4.479911124018905 | 0.794 | 1.041 | 1.423 |
| 4.483052716672495 | 0.797 | 1.041 | 1.417 |
| 4.486194309326085 | 0.8 | 1.041 | 1.41 |
| 4.489335901979674 | 0.803 | 1.041 | 1.404 |
| 4.492477494633264 | 0.806 | 1.041 | 1.398 |
| 4.495619087286854 | 0.809 | 1.041 | 1.391 |
| 4.498760679940443 | 0.812 | 1.042 | 1.385 |
| 4.501902272594033 | 0.815 | 1.042 | 1.379 |
| 4.505043865247622 | 0.817 | 1.042 | 1.372 |
| 4.508185457901212 | 0.82 | 1.042 | 1.366 |
| 4.511327050554801 | 0.823 | 1.042 | 1.36 |
| 4.514468643208391 | 0.826 | 1.042 | 1.354 |
| 4.517610235861981 | 0.829 | 1.042 | 1.348 |
| 4.520751828515571 | 0.832 | 1.042 | 1.341 |
| 4.52389342116916 | 0.835 | 1.041 | 1.335 |
| 4.52703501382275 | 0.838 | 1.041 | 1.329 |
| 4.530176606476339 | 0.841 | 1.041 | 1.323 |
| 4.533318199129928 | 0.844 | 1.041 | 1.317 |
| 4.536459791783518 | 0.847 | 1.041 | 1.311 |
| 4.539601384437108 | 0.85 | 1.041 | 1.305 |
| 4.542742977090698 | 0.852 | 1.041 | 1.299 |
| 4.545884569744287 | 0.855 | 1.04 | 1.293 |
| 4.549026162397876 | 0.858 | 1.04 | 1.287 |
| 4.552167755051466 | 0.861 | 1.04 | 1.281 |
| 4.555309347705056 | 0.864 | 1.04 | 1.275 |
| 4.558450940358646 | 0.867 | 1.039 | 1.269 |
| 4.561592533012235 | 0.87 | 1.039 | 1.263 |
| 4.564734125665825 | 0.873 | 1.039 | 1.257 |
| 4.567875718319415 | 0.875 | 1.038 | 1.251 |
| 4.571017310973004 | 0.878 | 1.038 | 1.245 |
| 4.574158903626594 | 0.881 | 1.037 | 1.239 |
| 4.577300496280183 | 0.884 | 1.037 | 1.233 |
| 4.580442088933772 | 0.887 | 1.037 | 1.227 |
| 4.583583681587362 | 0.89 | 1.036 | 1.222 |
| 4.586725274240952 | 0.893 | 1.036 | 1.216 |
| 4.589866866894542 | 0.895 | 1.035 | 1.21 |
| 4.593008459548131 | 0.898 | 1.035 | 1.204 |
| 4.596150052201721 | 0.901 | 1.034 | 1.199 |
| 4.59929164485531 | 0.904 | 1.033 | 1.193 |
| 4.6024332375089 | 0.907 | 1.033 | 1.187 |
| 4.60557483016249 | 0.909 | 1.032 | 1.182 |
| 4.608716422816079 | 0.912 | 1.032 | 1.176 |
| 4.611858015469668 | 0.915 | 1.031 | 1.17 |
| 4.614999608123258 | 0.918 | 1.03 | 1.165 |
| 4.618141200776848 | 0.921 | 1.03 | 1.159 |
| 4.621282793430437 | 0.923 | 1.029 | 1.154 |
| 4.624424386084027 | 0.926 | 1.028 | 1.148 |
| 4.627565978737617 | 0.929 | 1.027 | 1.142 |
| 4.630707571391206 | 0.932 | 1.027 | 1.137 |
| 4.633849164044795 | 0.934 | 1.026 | 1.131 |
| 4.636990756698386 | 0.937 | 1.025 | 1.126 |
| 4.640132349351975 | 0.94 | 1.024 | 1.12 |
| 4.643273942005564 | 0.942 | 1.023 | 1.115 |
| 4.646415534659154 | 0.945 | 1.022 | 1.11 |
| 4.649557127312744 | 0.948 | 1.022 | 1.104 |
| 4.652698719966334 | 0.951 | 1.021 | 1.099 |
| 4.655840312619923 | 0.953 | 1.02 | 1.093 |
| 4.658981905273513 | 0.956 | 1.019 | 1.088 |
| 4.662123497927102 | 0.959 | 1.018 | 1.083 |
| 4.665265090580692 | 0.961 | 1.017 | 1.077 |
| 4.668406683234282 | 0.964 | 1.016 | 1.072 |
| 4.671548275887871 | 0.967 | 1.015 | 1.067 |
| 4.674689868541461 | 0.969 | 1.014 | 1.062 |
| 4.67783146119505 | 0.972 | 1.013 | 1.056 |
| 4.68097305384864 | 0.974 | 1.012 | 1.051 |
| 4.68411464650223 | 0.977 | 1.011 | 1.046 |
| 4.687256239155819 | 0.98 | 1.009 | 1.041 |
| 4.690397831809409 | 0.982 | 1.008 | 1.036 |
| 4.693539424462998 | 0.985 | 1.007 | 1.03 |
| 4.696681017116588 | 0.987 | 1.006 | 1.025 |
| 4.699822609770177 | 0.99 | 1.005 | 1.02 |
| 4.702964202423767 | 0.992 | 1.004 | 1.015 |
| 4.706105795077356 | 0.995 | 1.002 | 1.01 |
| 4.709247387730946 | 0.997 | 1.001 | 1.005 |
| 4.712388980384535 | 1 | 1 | 1 |
| 4.715530573038126 | 1.003 | 0.999 | 0.995 |
| 4.718672165691715 | 1.005 | 0.997 | 0.99 |
| 4.721813758345305 | 1.007 | 0.996 | 0.985 |
| 4.724955350998894 | 1.01 | 0.995 | 0.98 |
| 4.728096943652484 | 1.012 | 0.994 | 0.975 |
| 4.731238536306074 | 1.015 | 0.992 | 0.97 |
| 4.734380128959663 | 1.017 | 0.991 | 0.965 |
| 4.737521721613253 | 1.02 | 0.989 | 0.96 |
| 4.740663314266842 | 1.022 | 0.988 | 0.955 |
| 4.743804906920432 | 1.025 | 0.987 | 0.951 |
| 4.74694649957402 | 1.027 | 0.985 | 0.946 |
| 4.750088092227611 | 1.029 | 0.984 | 0.941 |
| 4.7532296848812 | 1.032 | 0.982 | 0.936 |
| 4.75637127753479 | 1.034 | 0.981 | 0.931 |
| 4.75951287018838 | 1.036 | 0.979 | 0.927 |
| 4.76265446284197 | 1.039 | 0.978 | 0.922 |
| 4.765796055495559 | 1.041 | 0.976 | 0.917 |
| 4.768937648149149 | 1.043 | 0.975 | 0.912 |
| 4.772079240802738 | 1.046 | 0.973 | 0.908 |
| 4.775220833456327 | 1.048 | 0.972 | 0.903 |
| 4.778362426109917 | 1.05 | 0.97 | 0.898 |
| 4.781504018763507 | 1.053 | 0.968 | 0.894 |
| 4.784645611417097 | 1.055 | 0.967 | 0.889 |
| 4.787787204070686 | 1.057 | 0.965 | 0.885 |
| 4.790928796724275 | 1.059 | 0.963 | 0.88 |
| 4.794070389377865 | 1.061 | 0.962 | 0.875 |
| 4.797211982031455 | 1.064 | 0.96 | 0.871 |
| 4.800353574685045 | 1.066 | 0.958 | 0.866 |
| 4.803495167338634 | 1.068 | 0.957 | 0.862 |
| 4.806636759992224 | 1.07 | 0.955 | 0.857 |
| 4.809778352645814 | 1.072 | 0.953 | 0.853 |
| 4.812919945299403 | 1.074 | 0.951 | 0.848 |
| 4.816061537952993 | 1.077 | 0.95 | 0.844 |
| 4.819203130606582 | 1.079 | 0.948 | 0.839 |
| 4.822344723260172 | 1.081 | 0.946 | 0.835 |
| 4.825486315913761 | 1.083 | 0.944 | 0.831 |
| 4.828627908567351 | 1.085 | 0.942 | 0.826 |
| 4.83176950122094 | 1.087 | 0.94 | 0.822 |
| 4.83491109387453 | 1.089 | 0.939 | 0.817 |
| 4.83805268652812 | 1.091 | 0.937 | 0.813 |
| 4.841194279181709 | 1.093 | 0.935 | 0.809 |
| 4.844335871835299 | 1.095 | 0.933 | 0.804 |
| 4.847477464488889 | 1.097 | 0.931 | 0.8 |
| 4.850619057142478 | 1.099 | 0.929 | 0.796 |
| 4.853760649796068 | 1.101 | 0.927 | 0.792 |
| 4.856902242449657 | 1.103 | 0.925 | 0.787 |
| 4.860043835103247 | 1.105 | 0.923 | 0.783 |
| 4.863185427756837 | 1.106 | 0.921 | 0.779 |
| 4.866327020410426 | 1.108 | 0.919 | 0.775 |
| 4.869468613064015 | 1.11 | 0.917 | 0.771 |
| 4.872610205717605 | 1.112 | 0.915 | 0.766 |
| 4.875751798371195 | 1.114 | 0.913 | 0.762 |
| 4.878893391024784 | 1.116 | 0.911 | 0.758 |
| 4.882034983678374 | 1.117 | 0.909 | 0.754 |
| 4.885176576331964 | 1.119 | 0.907 | 0.75 |
| 4.888318168985553 | 1.121 | 0.905 | 0.746 |
| 4.891459761639143 | 1.123 | 0.903 | 0.742 |
| 4.894601354292733 | 1.124 | 0.901 | 0.738 |
| 4.897742946946322 | 1.126 | 0.899 | 0.734 |
| 4.900884539599912 | 1.128 | 0.896 | 0.73 |
| 4.904026132253501 | 1.129 | 0.894 | 0.726 |
| 4.907167724907091 | 1.131 | 0.892 | 0.722 |
| 4.91030931756068 | 1.132 | 0.89 | 0.718 |
| 4.91345091021427 | 1.134 | 0.888 | 0.714 |
| 4.91659250286786 | 1.136 | 0.886 | 0.71 |
| 4.91973409552145 | 1.137 | 0.883 | 0.706 |
| 4.922875688175039 | 1.139 | 0.881 | 0.702 |
| 4.926017280828628 | 1.14 | 0.879 | 0.698 |
| 4.929158873482218 | 1.142 | 0.877 | 0.694 |
| 4.932300466135808 | 1.143 | 0.874 | 0.69 |
| 4.935442058789397 | 1.145 | 0.872 | 0.687 |
| 4.938583651442987 | 1.146 | 0.87 | 0.683 |
| 4.941725244096576 | 1.148 | 0.868 | 0.679 |
| 4.944866836750166 | 1.149 | 0.865 | 0.675 |
| 4.948008429403755 | 1.15 | 0.863 | 0.671 |
| 4.951150022057345 | 1.152 | 0.861 | 0.668 |
| 4.954291614710935 | 1.153 | 0.858 | 0.664 |
| 4.957433207364524 | 1.154 | 0.856 | 0.66 |
| 4.960574800018114 | 1.156 | 0.854 | 0.656 |
| 4.963716392671704 | 1.157 | 0.851 | 0.653 |
| 4.966857985325293 | 1.158 | 0.849 | 0.649 |
| 4.969999577978883 | 1.159 | 0.847 | 0.645 |
| 4.973141170632472 | 1.161 | 0.844 | 0.642 |
| 4.976282763286062 | 1.162 | 0.842 | 0.638 |
| 4.979424355939651 | 1.163 | 0.839 | 0.634 |
| 4.982565948593241 | 1.164 | 0.837 | 0.631 |
| 4.985707541246831 | 1.165 | 0.835 | 0.627 |
| 4.98884913390042 | 1.166 | 0.832 | 0.623 |
| 4.99199072655401 | 1.167 | 0.83 | 0.62 |
| 4.9951323192076 | 1.168 | 0.827 | 0.616 |
| 4.99827391186119 | 1.169 | 0.825 | 0.613 |
| 5.00141550451478 | 1.17 | 0.822 | 0.609 |
| 5.004557097168369 | 1.171 | 0.82 | 0.606 |
| 5.007698689821958 | 1.172 | 0.817 | 0.602 |
| 5.010840282475548 | 1.173 | 0.815 | 0.599 |
| 5.013981875129137 | 1.174 | 0.812 | 0.595 |
| 5.017123467782727 | 1.175 | 0.81 | 0.592 |
| 5.020265060436317 | 1.176 | 0.807 | 0.588 |
| 5.023406653089906 | 1.177 | 0.805 | 0.585 |
| 5.026548245743496 | 1.178 | 0.802 | 0.581 |
| 5.029689838397085 | 1.178 | 0.8 | 0.578 |
| 5.032831431050674 | 1.179 | 0.797 | 0.575 |
| 5.035973023704264 | 1.18 | 0.795 | 0.571 |
| 5.039114616357854 | 1.181 | 0.792 | 0.568 |
| 5.042256209011444 | 1.181 | 0.789 | 0.565 |
| 5.045397801665033 | 1.182 | 0.787 | 0.561 |
| 5.048539394318622 | 1.183 | 0.784 | 0.558 |
| 5.051680986972213 | 1.183 | 0.782 | 0.555 |
| 5.054822579625802 | 1.184 | 0.779 | 0.551 |
| 5.057964172279392 | 1.184 | 0.776 | 0.548 |
| 5.061105764932981 | 1.185 | 0.774 | 0.545 |
| 5.064247357586571 | 1.186 | 0.771 | 0.541 |
| 5.067388950240161 | 1.186 | 0.769 | 0.538 |
| 5.07053054289375 | 1.187 | 0.766 | 0.535 |
| 5.07367213554734 | 1.187 | 0.763 | 0.532 |
| 5.07681372820093 | 1.187 | 0.761 | 0.529 |
| 5.079955320854519 | 1.188 | 0.758 | 0.525 |
| 5.083096913508108 | 1.188 | 0.755 | 0.522 |
| 5.086238506161698 | 1.188 | 0.753 | 0.519 |
| 5.089380098815288 | 1.189 | 0.75 | 0.516 |
| 5.092521691468877 | 1.189 | 0.747 | 0.513 |
| 5.095663284122466 | 1.189 | 0.745 | 0.51 |
| 5.098804876776057 | 1.19 | 0.742 | 0.507 |
| 5.101946469429646 | 1.19 | 0.739 | 0.503 |
| 5.105088062083236 | 1.19 | 0.737 | 0.5 |
| 5.108229654736825 | 1.19 | 0.734 | 0.497 |
| 5.111371247390415 | 1.19 | 0.731 | 0.494 |
| 5.114512840044005 | 1.19 | 0.728 | 0.491 |
| 5.117654432697594 | 1.19 | 0.726 | 0.488 |
| 5.120796025351184 | 1.19 | 0.723 | 0.485 |
| 5.123937618004773 | 1.19 | 0.72 | 0.482 |
| 5.127079210658363 | 1.19 | 0.717 | 0.479 |
| 5.130220803311953 | 1.19 | 0.715 | 0.476 |
| 5.133362395965542 | 1.19 | 0.712 | 0.473 |
| 5.136503988619131 | 1.19 | 0.709 | 0.47 |
| 5.13964558127272 | 1.19 | 0.706 | 0.467 |
| 5.142787173926311 | 1.19 | 0.704 | 0.464 |
| 5.1459287665799 | 1.19 | 0.701 | 0.461 |
| 5.14907035923349 | 1.19 | 0.698 | 0.458 |
| 5.15221195188708 | 1.189 | 0.695 | 0.456 |
| 5.15535354454067 | 1.189 | 0.692 | 0.453 |
| 5.158495137194259 | 1.189 | 0.69 | 0.45 |
| 5.161636729847848 | 1.188 | 0.687 | 0.447 |
| 5.164778322501438 | 1.188 | 0.684 | 0.444 |
| 5.167919915155028 | 1.188 | 0.681 | 0.441 |
| 5.171061507808617 | 1.187 | 0.678 | 0.438 |
| 5.174203100462206 | 1.187 | 0.676 | 0.436 |
| 5.177344693115796 | 1.186 | 0.673 | 0.433 |
| 5.180486285769386 | 1.186 | 0.67 | 0.43 |
| 5.183627878422976 | 1.185 | 0.667 | 0.427 |
| 5.186769471076565 | 1.185 | 0.664 | 0.424 |
| 5.189911063730155 | 1.184 | 0.662 | 0.422 |
| 5.193052656383744 | 1.184 | 0.659 | 0.419 |
| 5.196194249037334 | 1.183 | 0.656 | 0.416 |
| 5.199335841690924 | 1.182 | 0.653 | 0.414 |
| 5.202477434344513 | 1.181 | 0.65 | 0.411 |
| 5.205619026998103 | 1.181 | 0.647 | 0.408 |
| 5.208760619651692 | 1.18 | 0.645 | 0.405 |
| 5.211902212305282 | 1.179 | 0.642 | 0.403 |
| 5.215043804958871 | 1.178 | 0.639 | 0.4 |
| 5.218185397612461 | 1.177 | 0.636 | 0.397 |
| 5.221326990266051 | 1.176 | 0.633 | 0.395 |
| 5.22446858291964 | 1.176 | 0.63 | 0.392 |
| 5.22761017557323 | 1.175 | 0.627 | 0.39 |
| 5.23075176822682 | 1.174 | 0.625 | 0.387 |
| 5.23389336088041 | 1.173 | 0.622 | 0.384 |
| 5.237034953533999 | 1.172 | 0.619 | 0.382 |
| 5.240176546187588 | 1.17 | 0.616 | 0.379 |
| 5.243318138841178 | 1.169 | 0.613 | 0.377 |
| 5.246459731494767 | 1.168 | 0.61 | 0.374 |
| 5.249601324148357 | 1.167 | 0.607 | 0.372 |
| 5.252742916801947 | 1.166 | 0.605 | 0.369 |
| 5.255884509455536 | 1.165 | 0.602 | 0.367 |
| 5.259026102109125 | 1.163 | 0.599 | 0.364 |
| 5.262167694762715 | 1.162 | 0.596 | 0.362 |
| 5.265309287416305 | 1.161 | 0.593 | 0.359 |
| 5.268450880069895 | 1.159 | 0.59 | 0.357 |
| 5.271592472723484 | 1.158 | 0.587 | 0.354 |
| 5.274734065377074 | 1.156 | 0.584 | 0.352 |
| 5.277875658030664 | 1.155 | 0.582 | 0.349 |
| 5.281017250684253 | 1.153 | 0.579 | 0.347 |
| 5.284158843337843 | 1.152 | 0.576 | 0.344 |
| 5.287300435991432 | 1.15 | 0.573 | 0.342 |
| 5.290442028645022 | 1.149 | 0.57 | 0.34 |
| 5.293583621298612 | 1.147 | 0.567 | 0.337 |
| 5.296725213952201 | 1.145 | 0.564 | 0.335 |
| 5.299866806605791 | 1.144 | 0.561 | 0.333 |
| 5.30300839925938 | 1.142 | 0.559 | 0.33 |
| 5.30614999191297 | 1.14 | 0.556 | 0.328 |
| 5.30929158456656 | 1.138 | 0.553 | 0.326 |
| 5.312433177220149 | 1.137 | 0.55 | 0.323 |
| 5.315574769873739 | 1.135 | 0.547 | 0.321 |
| 5.318716362527328 | 1.133 | 0.544 | 0.319 |
| 5.321857955180918 | 1.131 | 0.541 | 0.316 |
| 5.324999547834508 | 1.129 | 0.538 | 0.314 |
| 5.328141140488097 | 1.127 | 0.536 | 0.312 |
| 5.331282733141686 | 1.125 | 0.533 | 0.309 |
| 5.334424325795276 | 1.123 | 0.53 | 0.307 |
| 5.337565918448866 | 1.121 | 0.527 | 0.305 |
| 5.340707511102456 | 1.119 | 0.524 | 0.303 |
| 5.343849103756045 | 1.117 | 0.521 | 0.301 |
| 5.346990696409634 | 1.114 | 0.518 | 0.298 |
| 5.350132289063224 | 1.112 | 0.515 | 0.296 |
| 5.353273881716814 | 1.11 | 0.513 | 0.294 |
| 5.356415474370403 | 1.108 | 0.51 | 0.292 |
| 5.359557067023993 | 1.105 | 0.507 | 0.29 |
| 5.362698659677583 | 1.103 | 0.504 | 0.288 |
| 5.365840252331172 | 1.101 | 0.501 | 0.285 |
| 5.368981844984762 | 1.098 | 0.498 | 0.283 |
| 5.372123437638351 | 1.096 | 0.495 | 0.281 |
| 5.375265030291941 | 1.093 | 0.493 | 0.279 |
| 5.378406622945531 | 1.091 | 0.49 | 0.277 |
| 5.38154821559912 | 1.088 | 0.487 | 0.275 |
| 5.38468980825271 | 1.086 | 0.484 | 0.273 |
| 5.387831400906299 | 1.083 | 0.481 | 0.271 |
| 5.39097299355989 | 1.08 | 0.478 | 0.269 |
| 5.394114586213479 | 1.078 | 0.476 | 0.267 |
| 5.397256178867068 | 1.075 | 0.473 | 0.264 |
| 5.400397771520657 | 1.072 | 0.47 | 0.262 |
| 5.403539364174247 | 1.07 | 0.467 | 0.26 |
| 5.406680956827837 | 1.067 | 0.464 | 0.258 |
| 5.409822549481426 | 1.064 | 0.461 | 0.256 |
| 5.412964142135016 | 1.061 | 0.459 | 0.254 |
| 5.416105734788605 | 1.058 | 0.456 | 0.252 |
| 5.419247327442195 | 1.055 | 0.453 | 0.25 |
| 5.422388920095785 | 1.052 | 0.45 | 0.248 |
| 5.425530512749375 | 1.049 | 0.447 | 0.246 |
| 5.428672105402964 | 1.046 | 0.444 | 0.245 |
| 5.431813698056554 | 1.043 | 0.442 | 0.243 |
| 5.434955290710143 | 1.04 | 0.439 | 0.241 |
| 5.438096883363733 | 1.037 | 0.436 | 0.239 |
| 5.441238476017322 | 1.034 | 0.433 | 0.237 |
| 5.444380068670912 | 1.031 | 0.431 | 0.235 |
| 5.447521661324502 | 1.028 | 0.428 | 0.233 |
| 5.450663253978091 | 1.024 | 0.425 | 0.231 |
| 5.453804846631681 | 1.021 | 0.422 | 0.229 |
| 5.456946439285271 | 1.018 | 0.419 | 0.227 |
| 5.46008803193886 | 1.014 | 0.417 | 0.226 |
| 5.46322962459245 | 1.011 | 0.414 | 0.224 |
| 5.466371217246039 | 1.008 | 0.411 | 0.222 |
| 5.46951280989963 | 1.004 | 0.408 | 0.22 |
| 5.472654402553218 | 1.001 | 0.406 | 0.218 |
| 5.475795995206808 | 0.997 | 0.403 | 0.216 |
| 5.478937587860398 | 0.994 | 0.4 | 0.215 |
| 5.482079180513987 | 0.99 | 0.397 | 0.213 |
| 5.485220773167577 | 0.987 | 0.395 | 0.211 |
| 5.488362365821166 | 0.983 | 0.392 | 0.209 |
| 5.491503958474756 | 0.98 | 0.389 | 0.207 |
| 5.494645551128346 | 0.976 | 0.386 | 0.206 |
| 5.497787143781935 | 0.972 | 0.384 | 0.204 |
| 5.500928736435525 | 0.968 | 0.381 | 0.202 |
| 5.504070329089115 | 0.965 | 0.378 | 0.2 |
| 5.507211921742704 | 0.961 | 0.376 | 0.199 |
| 5.510353514396294 | 0.957 | 0.373 | 0.197 |
| 5.513495107049883 | 0.953 | 0.37 | 0.195 |
| 5.516636699703473 | 0.949 | 0.368 | 0.194 |
| 5.519778292357062 | 0.946 | 0.365 | 0.192 |
| 5.522919885010652 | 0.942 | 0.362 | 0.19 |
| 5.526061477664242 | 0.938 | 0.36 | 0.189 |
| 5.529203070317831 | 0.934 | 0.357 | 0.187 |
| 5.532344662971421 | 0.93 | 0.354 | 0.185 |
| 5.535486255625011 | 0.926 | 0.352 | 0.184 |
| 5.5386278482786 | 0.922 | 0.349 | 0.182 |
| 5.54176944093219 | 0.918 | 0.346 | 0.18 |
| 5.544911033585779 | 0.914 | 0.344 | 0.179 |
| 5.54805262623937 | 0.909 | 0.341 | 0.177 |
| 5.551194218892959 | 0.905 | 0.338 | 0.176 |
| 5.554335811546548 | 0.901 | 0.336 | 0.174 |
| 5.557477404200137 | 0.897 | 0.333 | 0.172 |
| 5.560618996853727 | 0.893 | 0.331 | 0.171 |
| 5.563760589507317 | 0.888 | 0.328 | 0.169 |
| 5.566902182160906 | 0.884 | 0.325 | 0.168 |
| 5.570043774814496 | 0.88 | 0.323 | 0.166 |
| 5.573185367468086 | 0.875 | 0.32 | 0.165 |
| 5.576326960121675 | 0.871 | 0.318 | 0.163 |
| 5.579468552775264 | 0.867 | 0.315 | 0.162 |
| 5.582610145428854 | 0.862 | 0.313 | 0.16 |
| 5.585751738082444 | 0.858 | 0.31 | 0.159 |
| 5.588893330736034 | 0.853 | 0.308 | 0.157 |
| 5.592034923389623 | 0.849 | 0.305 | 0.156 |
| 5.595176516043213 | 0.844 | 0.303 | 0.154 |
| 5.598318108696803 | 0.84 | 0.3 | 0.153 |
| 5.601459701350392 | 0.835 | 0.297 | 0.151 |
| 5.604601294003982 | 0.831 | 0.295 | 0.15 |
| 5.607742886657571 | 0.826 | 0.292 | 0.148 |
| 5.610884479311161 | 0.822 | 0.29 | 0.147 |
| 5.61402607196475 | 0.817 | 0.288 | 0.145 |
| 5.61716766461834 | 0.812 | 0.285 | 0.144 |
| 5.62030925727193 | 0.808 | 0.283 | 0.142 |
| 5.623450849925519 | 0.803 | 0.28 | 0.141 |
| 5.626592442579109 | 0.798 | 0.278 | 0.14 |
| 5.629734035232698 | 0.794 | 0.275 | 0.138 |
| 5.632875627886288 | 0.789 | 0.273 | 0.137 |
| 5.636017220539878 | 0.784 | 0.27 | 0.135 |
| 5.639158813193467 | 0.779 | 0.268 | 0.134 |
| 5.642300405847057 | 0.775 | 0.266 | 0.133 |
| 5.645441998500646 | 0.77 | 0.263 | 0.131 |
| 5.648583591154236 | 0.765 | 0.261 | 0.13 |
| 5.651725183807825 | 0.76 | 0.258 | 0.129 |
| 5.654866776461415 | 0.755 | 0.256 | 0.127 |
| 5.658008369115005 | 0.75 | 0.254 | 0.126 |
| 5.661149961768594 | 0.745 | 0.251 | 0.125 |
| 5.664291554422184 | 0.74 | 0.249 | 0.123 |
| 5.667433147075774 | 0.736 | 0.247 | 0.122 |
| 5.670574739729363 | 0.731 | 0.244 | 0.121 |
| 5.673716332382953 | 0.726 | 0.242 | 0.119 |
| 5.676857925036542 | 0.721 | 0.24 | 0.118 |
| 5.679999517690132 | 0.716 | 0.237 | 0.117 |
| 5.683141110343721 | 0.711 | 0.235 | 0.116 |
| 5.686282702997311 | 0.706 | 0.233 | 0.114 |
| 5.689424295650901 | 0.701 | 0.23 | 0.113 |
| 5.69256588830449 | 0.695 | 0.228 | 0.112 |
| 5.69570748095808 | 0.69 | 0.226 | 0.111 |
| 5.69884907361167 | 0.685 | 0.224 | 0.109 |
| 5.701990666265259 | 0.68 | 0.221 | 0.108 |
| 5.705132258918849 | 0.675 | 0.219 | 0.107 |
| 5.708273851572438 | 0.67 | 0.217 | 0.106 |
| 5.711415444226028 | 0.665 | 0.215 | 0.105 |
| 5.714557036879618 | 0.66 | 0.212 | 0.103 |
| 5.717698629533207 | 0.655 | 0.21 | 0.102 |
| 5.720840222186797 | 0.649 | 0.208 | 0.101 |
| 5.723981814840386 | 0.644 | 0.206 | 0.1 |
| 5.727123407493976 | 0.639 | 0.204 | 0.099 |
| 5.730265000147565 | 0.634 | 0.201 | 0.098 |
| 5.733406592801155 | 0.629 | 0.199 | 0.096 |
| 5.736548185454744 | 0.624 | 0.197 | 0.095 |
| 5.739689778108334 | 0.618 | 0.195 | 0.094 |
| 5.742831370761924 | 0.613 | 0.193 | 0.093 |
| 5.745972963415514 | 0.608 | 0.191 | 0.092 |
| 5.749114556069103 | 0.603 | 0.189 | 0.091 |
| 5.752256148722693 | 0.597 | 0.186 | 0.09 |
| 5.755397741376282 | 0.592 | 0.184 | 0.089 |
| 5.758539334029872 | 0.587 | 0.182 | 0.088 |
| 5.761680926683462 | 0.582 | 0.18 | 0.087 |
| 5.764822519337051 | 0.576 | 0.178 | 0.085 |
| 5.767964111990641 | 0.571 | 0.176 | 0.084 |
| 5.77110570464423 | 0.566 | 0.174 | 0.083 |
| 5.77424729729782 | 0.561 | 0.172 | 0.082 |
| 5.77738888995141 | 0.555 | 0.17 | 0.081 |
| 5.780530482605 | 0.55 | 0.168 | 0.08 |
| 5.783672075258588 | 0.545 | 0.166 | 0.079 |
| 5.786813667912178 | 0.54 | 0.164 | 0.078 |
| 5.789955260565768 | 0.534 | 0.162 | 0.077 |
| 5.793096853219358 | 0.529 | 0.16 | 0.076 |
| 5.796238445872947 | 0.524 | 0.158 | 0.075 |
| 5.799380038526537 | 0.519 | 0.156 | 0.074 |
| 5.802521631180126 | 0.513 | 0.154 | 0.073 |
| 5.805663223833715 | 0.508 | 0.152 | 0.072 |
| 5.808804816487306 | 0.503 | 0.15 | 0.071 |
| 5.811946409140895 | 0.498 | 0.148 | 0.07 |
| 5.815088001794485 | 0.492 | 0.147 | 0.069 |
| 5.818229594448074 | 0.487 | 0.145 | 0.068 |
| 5.821371187101663 | 0.482 | 0.143 | 0.067 |
| 5.824512779755254 | 0.477 | 0.141 | 0.066 |
| 5.827654372408843 | 0.471 | 0.139 | 0.066 |
| 5.830795965062433 | 0.466 | 0.137 | 0.065 |
| 5.833937557716022 | 0.461 | 0.135 | 0.064 |
| 5.837079150369612 | 0.456 | 0.134 | 0.063 |
| 5.840220743023201 | 0.45 | 0.132 | 0.062 |
| 5.843362335676791 | 0.445 | 0.13 | 0.061 |
| 5.846503928330381 | 0.44 | 0.128 | 0.06 |
| 5.84964552098397 | 0.435 | 0.126 | 0.059 |
| 5.85278711363756 | 0.43 | 0.125 | 0.058 |
| 5.85592870629115 | 0.425 | 0.123 | 0.057 |
| 5.85907029894474 | 0.419 | 0.121 | 0.057 |
| 5.862211891598329 | 0.414 | 0.119 | 0.056 |
| 5.865353484251918 | 0.409 | 0.118 | 0.055 |
| 5.868495076905508 | 0.404 | 0.116 | 0.054 |
| 5.871636669559098 | 0.399 | 0.114 | 0.053 |
| 5.874778262212687 | 0.394 | 0.113 | 0.052 |
| 5.877919854866277 | 0.389 | 0.111 | 0.052 |
| 5.881061447519866 | 0.384 | 0.109 | 0.051 |
| 5.884203040173456 | 0.379 | 0.108 | 0.05 |
| 5.887344632827046 | 0.373 | 0.106 | 0.049 |
| 5.890486225480635 | 0.368 | 0.104 | 0.048 |
| 5.893627818134224 | 0.363 | 0.103 | 0.048 |
| 5.896769410787814 | 0.358 | 0.101 | 0.047 |
| 5.899911003441404 | 0.353 | 0.1 | 0.046 |
| 5.903052596094994 | 0.348 | 0.098 | 0.045 |
| 5.906194188748583 | 0.344 | 0.096 | 0.045 |
| 5.909335781402172 | 0.339 | 0.095 | 0.044 |
| 5.912477374055762 | 0.334 | 0.093 | 0.043 |
| 5.915618966709352 | 0.329 | 0.092 | 0.042 |
| 5.918760559362942 | 0.324 | 0.09 | 0.042 |
| 5.921902152016531 | 0.319 | 0.089 | 0.041 |
| 5.92504374467012 | 0.314 | 0.087 | 0.04 |
| 5.92818533732371 | 0.309 | 0.086 | 0.039 |
| 5.9313269299773 | 0.305 | 0.084 | 0.039 |
| 5.93446852263089 | 0.3 | 0.083 | 0.038 |
| 5.93761011528448 | 0.295 | 0.081 | 0.037 |
| 5.940751707938068 | 0.29 | 0.08 | 0.037 |
| 5.943893300591658 | 0.286 | 0.078 | 0.036 |
| 5.947034893245248 | 0.281 | 0.077 | 0.035 |
| 5.950176485898837 | 0.276 | 0.076 | 0.035 |
| 5.953318078552427 | 0.272 | 0.074 | 0.034 |
| 5.956459671206017 | 0.267 | 0.073 | 0.033 |
| 5.959601263859606 | 0.262 | 0.071 | 0.033 |
| 5.962742856513196 | 0.258 | 0.07 | 0.032 |
| 5.965884449166785 | 0.253 | 0.069 | 0.031 |
| 5.969026041820375 | 0.249 | 0.067 | 0.031 |
| 5.972167634473964 | 0.244 | 0.066 | 0.03 |
| 5.975309227127554 | 0.24 | 0.065 | 0.03 |
| 5.978450819781144 | 0.235 | 0.063 | 0.029 |
| 5.981592412434733 | 0.231 | 0.062 | 0.028 |
| 5.984734005088323 | 0.227 | 0.061 | 0.028 |
| 5.987875597741913 | 0.222 | 0.06 | 0.027 |
| 5.991017190395502 | 0.218 | 0.058 | 0.027 |
| 5.994158783049092 | 0.214 | 0.057 | 0.026 |
| 5.997300375702681 | 0.209 | 0.056 | 0.025 |
| 6.000441968356271 | 0.205 | 0.055 | 0.025 |
| 6.003583561009861 | 0.201 | 0.054 | 0.024 |
| 6.00672515366345 | 0.197 | 0.052 | 0.024 |
| 6.00986674631704 | 0.193 | 0.051 | 0.023 |
| 6.01300833897063 | 0.189 | 0.05 | 0.023 |
| 6.01614993162422 | 0.185 | 0.049 | 0.022 |
| 6.019291524277808 | 0.181 | 0.048 | 0.022 |
| 6.022433116931398 | 0.177 | 0.047 | 0.021 |
| 6.025574709584988 | 0.173 | 0.046 | 0.021 |
| 6.028716302238577 | 0.169 | 0.044 | 0.02 |
| 6.031857894892167 | 0.165 | 0.043 | 0.02 |
| 6.034999487545757 | 0.161 | 0.042 | 0.019 |
| 6.038141080199346 | 0.157 | 0.041 | 0.019 |
| 6.041282672852935 | 0.153 | 0.04 | 0.018 |
| 6.044424265506525 | 0.15 | 0.039 | 0.018 |
| 6.047565858160115 | 0.146 | 0.038 | 0.017 |
| 6.050707450813704 | 0.142 | 0.037 | 0.017 |
| 6.053849043467294 | 0.139 | 0.036 | 0.016 |
| 6.056990636120884 | 0.135 | 0.035 | 0.016 |
| 6.060132228774473 | 0.132 | 0.034 | 0.015 |
| 6.063273821428063 | 0.128 | 0.033 | 0.015 |
| 6.066415414081653 | 0.125 | 0.032 | 0.015 |
| 6.069557006735242 | 0.121 | 0.031 | 0.014 |
| 6.072698599388831 | 0.118 | 0.031 | 0.014 |
| 6.07584019204242 | 0.114 | 0.03 | 0.013 |
| 6.078981784696011 | 0.111 | 0.029 | 0.013 |
| 6.082123377349601 | 0.108 | 0.028 | 0.013 |
| 6.08526497000319 | 0.105 | 0.027 | 0.012 |
| 6.08840656265678 | 0.101 | 0.026 | 0.012 |
| 6.09154815531037 | 0.098 | 0.025 | 0.011 |
| 6.094689747963959 | 0.095 | 0.025 | 0.011 |
| 6.097831340617549 | 0.092 | 0.024 | 0.011 |
| 6.100972933271138 | 0.089 | 0.023 | 0.01 |
| 6.104114525924728 | 0.086 | 0.022 | 0.01 |
| 6.107256118578317 | 0.083 | 0.021 | 0.01 |
| 6.110397711231907 | 0.081 | 0.021 | 0.009 |
| 6.113539303885497 | 0.078 | 0.02 | 0.009 |
| 6.116680896539086 | 0.075 | 0.019 | 0.009 |
| 6.119822489192675 | 0.072 | 0.018 | 0.008 |
| 6.122964081846265 | 0.07 | 0.018 | 0.008 |
| 6.126105674499855 | 0.067 | 0.017 | 0.008 |
| 6.129247267153445 | 0.064 | 0.016 | 0.007 |
| 6.132388859807034 | 0.062 | 0.016 | 0.007 |
| 6.135530452460624 | 0.059 | 0.015 | 0.007 |
| 6.138672045114213 | 0.057 | 0.014 | 0.006 |
| 6.141813637767803 | 0.054 | 0.014 | 0.006 |
| 6.144955230421393 | 0.052 | 0.013 | 0.006 |
| 6.148096823074982 | 0.05 | 0.013 | 0.006 |
| 6.151238415728571 | 0.048 | 0.012 | 0.005 |
| 6.154380008382161 | 0.045 | 0.011 | 0.005 |
| 6.157521601035751 | 0.043 | 0.011 | 0.005 |
| 6.16066319368934 | 0.041 | 0.01 | 0.005 |
| 6.16380478634293 | 0.039 | 0.01 | 0.004 |
| 6.16694637899652 | 0.037 | 0.009 | 0.004 |
| 6.170087971650109 | 0.035 | 0.009 | 0.004 |
| 6.173229564303698 | 0.033 | 0.008 | 0.004 |
| 6.176371156957289 | 0.031 | 0.008 | 0.004 |
| 6.179512749610878 | 0.03 | 0.007 | 0.003 |
| 6.182654342264468 | 0.028 | 0.007 | 0.003 |
| 6.185795934918057 | 0.026 | 0.007 | 0.003 |
| 6.188937527571647 | 0.024 | 0.006 | 0.003 |
| 6.192079120225237 | 0.023 | 0.006 | 0.003 |
| 6.195220712878826 | 0.021 | 0.005 | 0.002 |
| 6.198362305532415 | 0.02 | 0.005 | 0.002 |
| 6.201503898186005 | 0.018 | 0.005 | 0.002 |
| 6.204645490839594 | 0.017 | 0.004 | 0.002 |
| 6.207787083493184 | 0.016 | 0.004 | 0.002 |
| 6.210928676146774 | 0.014 | 0.004 | 0.002 |
| 6.214070268800364 | 0.013 | 0.003 | 0.001 |
| 6.217211861453953 | 0.012 | 0.003 | 0.001 |
| 6.220353454107543 | 0.011 | 0.003 | 0.001 |
| 6.223495046761133 | 0.01 | 0.002 | 0.001 |
| 6.226636639414722 | 0.009 | 0.002 | 0.001 |
| 6.229778232068312 | 0.008 | 0.002 | 0.001 |
| 6.232919824721901 | 0.007 | 0.002 | 0.001 |
| 6.236061417375491 | 0.006 | 0.002 | 0.001 |
| 6.23920301002908 | 0.005 | 0.001 | 0.001 |
| 6.24234460268267 | 0.005 | 0.001 | 0.001 |
| 6.24548619533626 | 0.004 | 0.001 | 0 |
| 6.24862778798985 | 0.003 | 0.001 | 0 |
| 6.251769380643438 | 0.003 | 0.001 | 0 |
| 6.254910973297028 | 0.002 | 0.001 | 0 |
| 6.258052565950618 | 0.002 | 0 | 0 |
| 6.261194158604208 | 0.001 | 0 | 0 |
| 6.264335751257797 | 0.001 | 0 | 0 |
| 6.267477343911387 | 0.001 | 0 | 0 |
| 6.270618936564976 | 0 | 0 | 0 |
| 6.273760529218566 | 0 | 0 | 0 |
| 6.276902121872155 | 0 | 0 | 0 |
| 6.280043714525745 | 0 | 0 | 0 |
| 6.283185307179335 | 0 | 0 | 0 |